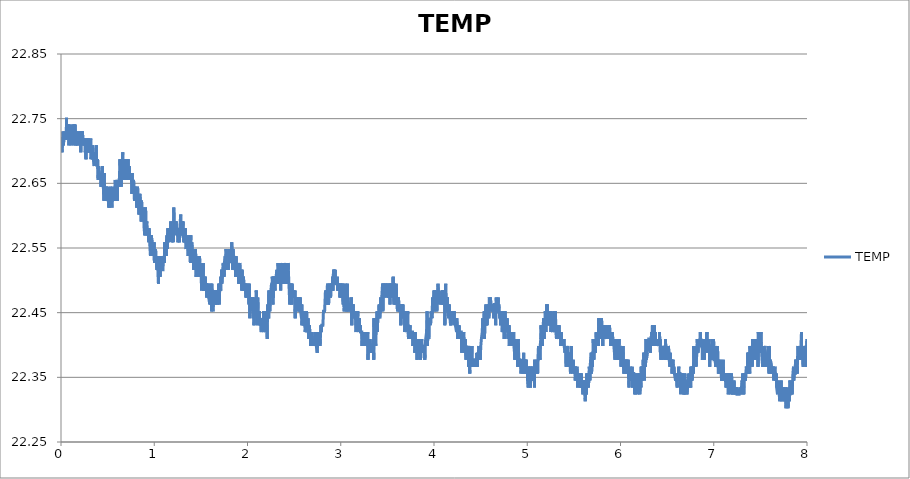
| Category | TEMP |
|---|---|
| 0.0009014404444444445 | 22.719 |
| 0.003960782083333334 | 22.709 |
| 0.007023179472222222 | 22.719 |
| 0.010082798916666667 | 22.698 |
| 0.013142973944444445 | 22.709 |
| 0.01620231561111111 | 22.719 |
| 0.019261657249999998 | 22.719 |
| 0.0223215545 | 22.73 |
| 0.02538089613888889 | 22.709 |
| 0.028439959999999997 | 22.709 |
| 0.03149930166666667 | 22.719 |
| 0.034559754472222225 | 22.719 |
| 0.037619373916666664 | 22.719 |
| 0.04067871558333333 | 22.73 |
| 0.043738057222222224 | 22.719 |
| 0.04679739888888889 | 22.719 |
| 0.04985701833333333 | 22.719 |
| 0.05291635997222222 | 22.719 |
| 0.05597597941666666 | 22.719 |
| 0.059035598861111115 | 22.752 |
| 0.06209466272222222 | 22.719 |
| 0.06515567113888888 | 22.719 |
| 0.06821584616666666 | 22.741 |
| 0.07127518780555556 | 22.73 |
| 0.07433480725 | 22.741 |
| 0.07739414891666667 | 22.719 |
| 0.08045321277777778 | 22.73 |
| 0.08351311 | 22.73 |
| 0.0865721738611111 | 22.709 |
| 0.08963151552777779 | 22.741 |
| 0.09269085716666665 | 22.719 |
| 0.09575158777777777 | 22.73 |
| 0.09881092944444443 | 22.719 |
| 0.10187082666666668 | 22.719 |
| 0.10492989052777778 | 22.73 |
| 0.10798923219444444 | 22.709 |
| 0.11104829602777777 | 22.73 |
| 0.11410763769444444 | 22.73 |
| 0.11716697933333332 | 22.719 |
| 0.12022604319444445 | 22.73 |
| 0.12328566263888889 | 22.741 |
| 0.12634500430555556 | 22.73 |
| 0.12940406816666666 | 22.73 |
| 0.132463132 | 22.719 |
| 0.13552330705555557 | 22.709 |
| 0.1385829265 | 22.73 |
| 0.1416422681388889 | 22.741 |
| 0.14470188758333333 | 22.719 |
| 0.14776122922222223 | 22.719 |
| 0.1508205708888889 | 22.741 |
| 0.15388019033333333 | 22.709 |
| 0.15693925419444443 | 22.709 |
| 0.15999859583333334 | 22.73 |
| 0.1630579375 | 22.719 |
| 0.16611700133333332 | 22.719 |
| 0.169176343 | 22.709 |
| 0.1722356846388889 | 22.719 |
| 0.17529530408333333 | 22.719 |
| 0.17835520133333335 | 22.709 |
| 0.18141454297222223 | 22.73 |
| 0.18447360683333333 | 22.73 |
| 0.1875368376111111 | 22.719 |
| 0.1905967348333333 | 22.719 |
| 0.19365718766666667 | 22.719 |
| 0.1967176405 | 22.719 |
| 0.1997792045 | 22.719 |
| 0.20284049069444443 | 22.73 |
| 0.2059014991111111 | 22.709 |
| 0.20896084075000002 | 22.719 |
| 0.21202101580555555 | 22.698 |
| 0.21508202419444444 | 22.73 |
| 0.21814247702777778 | 22.709 |
| 0.22120209647222222 | 22.719 |
| 0.22426393827777777 | 22.73 |
| 0.2273235577222222 | 22.719 |
| 0.23038428833333333 | 22.73 |
| 0.2334444633611111 | 22.719 |
| 0.23650630516666665 | 22.709 |
| 0.2395675913611111 | 22.719 |
| 0.24262915536111113 | 22.719 |
| 0.24568877480555557 | 22.719 |
| 0.24874811647222222 | 22.719 |
| 0.2518074581111111 | 22.709 |
| 0.25486791094444444 | 22.709 |
| 0.2579280859722222 | 22.719 |
| 0.2609913167222222 | 22.698 |
| 0.2640520473611111 | 22.709 |
| 0.26711722266666665 | 22.687 |
| 0.2701776755 | 22.709 |
| 0.2732603518055556 | 22.709 |
| 0.2763194156666667 | 22.698 |
| 0.2793798685 | 22.719 |
| 0.2824392101388889 | 22.709 |
| 0.28549882958333334 | 22.709 |
| 0.28855817125 | 22.709 |
| 0.29161751288888893 | 22.719 |
| 0.29467685455555553 | 22.698 |
| 0.29773619619444447 | 22.709 |
| 0.30079553786111113 | 22.709 |
| 0.30385515730555557 | 22.698 |
| 0.30691449894444445 | 22.709 |
| 0.3099752295555555 | 22.698 |
| 0.313034849 | 22.709 |
| 0.31609419066666666 | 22.709 |
| 0.31915325452777776 | 22.719 |
| 0.32221315175 | 22.687 |
| 0.32527582694444446 | 22.687 |
| 0.3283354463888889 | 22.687 |
| 0.3313945102222222 | 22.687 |
| 0.3344538518888889 | 22.698 |
| 0.33751486030555555 | 22.709 |
| 0.34057447975000005 | 22.687 |
| 0.34363382138888887 | 22.698 |
| 0.3466942742222222 | 22.687 |
| 0.3497558382222222 | 22.687 |
| 0.3528149020833333 | 22.687 |
| 0.3558742437222222 | 22.677 |
| 0.3589335853888889 | 22.677 |
| 0.3619934826111111 | 22.698 |
| 0.3650531020555556 | 22.687 |
| 0.3681121659166666 | 22.687 |
| 0.3711720631666667 | 22.698 |
| 0.37423612730555555 | 22.687 |
| 0.37729519116666665 | 22.709 |
| 0.38035508838888893 | 22.687 |
| 0.3834147078333333 | 22.677 |
| 0.38647488286111115 | 22.687 |
| 0.38953478011111115 | 22.677 |
| 0.39259439955555553 | 22.687 |
| 0.39565374119444446 | 22.687 |
| 0.3987130828611111 | 22.655 |
| 0.4017721467222222 | 22.666 |
| 0.4048314883611111 | 22.677 |
| 0.40789110780555554 | 22.677 |
| 0.4109504494722222 | 22.666 |
| 0.4140103466944445 | 22.666 |
| 0.4170694105555555 | 22.655 |
| 0.42012875222222223 | 22.655 |
| 0.4231883716666667 | 22.666 |
| 0.42624771330555555 | 22.655 |
| 0.4293081661388889 | 22.645 |
| 0.43236778558333333 | 22.666 |
| 0.43542740502777777 | 22.666 |
| 0.43848730225 | 22.655 |
| 0.4415466439166667 | 22.645 |
| 0.4446059855555556 | 22.677 |
| 0.44766532722222224 | 22.645 |
| 0.4507246688611111 | 22.666 |
| 0.4537840105 | 22.645 |
| 0.4568433521666667 | 22.645 |
| 0.45990324941666666 | 22.623 |
| 0.46296231325000003 | 22.666 |
| 0.46602304388888893 | 22.645 |
| 0.46908544124999996 | 22.623 |
| 0.47214506069444445 | 22.645 |
| 0.4752069025 | 22.645 |
| 0.47826652194444447 | 22.645 |
| 0.48132641919444447 | 22.623 |
| 0.48438576083333335 | 22.645 |
| 0.4874503805555555 | 22.645 |
| 0.4905097222222222 | 22.645 |
| 0.49357323077777776 | 22.645 |
| 0.49663423919444444 | 22.634 |
| 0.4996944142222222 | 22.645 |
| 0.5027543114444445 | 22.634 |
| 0.5058358766111111 | 22.634 |
| 0.50889994075 | 22.634 |
| 0.5119620603333334 | 22.612 |
| 0.5150222353611111 | 22.623 |
| 0.518081577 | 22.634 |
| 0.5211445299722222 | 22.612 |
| 0.5242149833888889 | 22.634 |
| 0.5272784919444444 | 22.623 |
| 0.5303408893055556 | 22.645 |
| 0.53340050875 | 22.623 |
| 0.5364606838055556 | 22.634 |
| 0.5395200254444444 | 22.623 |
| 0.5425793670833333 | 22.623 |
| 0.5456384309444444 | 22.612 |
| 0.5486983281944444 | 22.623 |
| 0.5517590588055555 | 22.645 |
| 0.5548203450277778 | 22.634 |
| 0.5578799644722222 | 22.634 |
| 0.5609398616944444 | 22.623 |
| 0.56400337025 | 22.623 |
| 0.5670652120555556 | 22.623 |
| 0.5701248315 | 22.634 |
| 0.5731861176944445 | 22.634 |
| 0.5762535153611111 | 22.623 |
| 0.579318412888889 | 22.645 |
| 0.5823780323333334 | 22.655 |
| 0.5854382073611112 | 22.634 |
| 0.5884981046111111 | 22.655 |
| 0.5915630021388889 | 22.645 |
| 0.5946242883333334 | 22.645 |
| 0.5976839077777778 | 22.645 |
| 0.6007438050277777 | 22.655 |
| 0.6038053690277777 | 22.623 |
| 0.6068669330277777 | 22.645 |
| 0.6099287748055556 | 22.645 |
| 0.6129889498611111 | 22.655 |
| 0.6160510694444444 | 22.655 |
| 0.6191159669722222 | 22.655 |
| 0.6221755864166667 | 22.645 |
| 0.62523465025 | 22.655 |
| 0.6282978810277777 | 22.666 |
| 0.6313580560555556 | 22.687 |
| 0.6344176755 | 22.677 |
| 0.6374772949444445 | 22.666 |
| 0.6405388589444444 | 22.677 |
| 0.6435987561944445 | 22.666 |
| 0.6466630981111111 | 22.645 |
| 0.6497257733055556 | 22.687 |
| 0.652786226111111 | 22.666 |
| 0.6558483457222222 | 22.677 |
| 0.6589090763333334 | 22.677 |
| 0.6619686957777777 | 22.698 |
| 0.6650305375555556 | 22.677 |
| 0.6680926571666667 | 22.677 |
| 0.671153943361111 | 22.666 |
| 0.6742143961944443 | 22.677 |
| 0.6772748490277777 | 22.655 |
| 0.6803408577222222 | 22.677 |
| 0.6834035328888889 | 22.687 |
| 0.6864650968888889 | 22.655 |
| 0.6895272164722223 | 22.666 |
| 0.6925868359166667 | 22.666 |
| 0.69564728875 | 22.677 |
| 0.698708019361111 | 22.677 |
| 0.7017695833611111 | 22.666 |
| 0.7048294806111112 | 22.666 |
| 0.70788882225 | 22.687 |
| 0.7109506640555556 | 22.687 |
| 0.7140100056944444 | 22.655 |
| 0.7170693473611112 | 22.666 |
| 0.7201292445833334 | 22.687 |
| 0.7231891418333333 | 22.666 |
| 0.7262487612777777 | 22.655 |
| 0.7293081029166667 | 22.666 |
| 0.7323674445833334 | 22.677 |
| 0.735427619611111 | 22.666 |
| 0.7384872390555556 | 22.666 |
| 0.7415490808333334 | 22.666 |
| 0.7446092558888889 | 22.655 |
| 0.7476683197222223 | 22.655 |
| 0.7507276613888889 | 22.655 |
| 0.7537872808333334 | 22.666 |
| 0.7568477336666667 | 22.655 |
| 0.7599104088333334 | 22.634 |
| 0.7629725284166666 | 22.666 |
| 0.7660352035833333 | 22.645 |
| 0.7690948230277778 | 22.655 |
| 0.7721549980833333 | 22.655 |
| 0.77521767325 | 22.645 |
| 0.778278403861111 | 22.655 |
| 0.7813383011111111 | 22.645 |
| 0.7843979205555556 | 22.645 |
| 0.7874619846944444 | 22.623 |
| 0.7905229931111112 | 22.645 |
| 0.79358233475 | 22.645 |
| 0.796642232 | 22.634 |
| 0.7997015736388889 | 22.634 |
| 0.80276230425 | 22.645 |
| 0.8058224793055556 | 22.645 |
| 0.8088851544722223 | 22.623 |
| 0.8119500519999999 | 22.612 |
| 0.8150093936388888 | 22.623 |
| 0.8180726244166667 | 22.612 |
| 0.8211352995833334 | 22.645 |
| 0.8241960301944444 | 22.645 |
| 0.8272562052222222 | 22.623 |
| 0.8303169358611111 | 22.612 |
| 0.8333787776388889 | 22.623 |
| 0.8364389526666667 | 22.602 |
| 0.8395002388888889 | 22.623 |
| 0.8425623584722222 | 22.623 |
| 0.845629478361111 | 22.634 |
| 0.8486899311666667 | 22.634 |
| 0.8517506618055556 | 22.623 |
| 0.8548116701944445 | 22.602 |
| 0.8578721230277777 | 22.623 |
| 0.8609361871666668 | 22.591 |
| 0.8639971955833333 | 22.623 |
| 0.8670573706111111 | 22.612 |
| 0.8701172678611111 | 22.612 |
| 0.8731793874444445 | 22.612 |
| 0.8762426182222223 | 22.602 |
| 0.8793025154444445 | 22.612 |
| 0.8823621348888889 | 22.612 |
| 0.8854234211111112 | 22.602 |
| 0.8884847073055555 | 22.602 |
| 0.8915448823333333 | 22.58 |
| 0.8946086686944444 | 22.58 |
| 0.8976716216666667 | 22.57 |
| 0.9007323522777777 | 22.58 |
| 0.903792805111111 | 22.57 |
| 0.9068554802777777 | 22.612 |
| 0.9099159331111111 | 22.591 |
| 0.9129813862222221 | 22.591 |
| 0.9160410056666667 | 22.58 |
| 0.9191053475833333 | 22.591 |
| 0.9221644114444444 | 22.58 |
| 0.9252254198611112 | 22.57 |
| 0.9282875394444444 | 22.58 |
| 0.9313468811111111 | 22.57 |
| 0.93440622275 | 22.58 |
| 0.9374661200000001 | 22.57 |
| 0.9405329620833334 | 22.559 |
| 0.9435923037222222 | 22.58 |
| 0.9466519231666666 | 22.57 |
| 0.9497129315833334 | 22.57 |
| 0.9527725510277778 | 22.57 |
| 0.9558330038611111 | 22.57 |
| 0.9588931788888889 | 22.538 |
| 0.9619536317222223 | 22.57 |
| 0.9650154734999999 | 22.538 |
| 0.9680750929444445 | 22.57 |
| 0.971134434611111 | 22.57 |
| 0.9741976653611111 | 22.57 |
| 0.9772586737777778 | 22.559 |
| 0.9803205155555555 | 22.559 |
| 0.9833823573611111 | 22.559 |
| 0.9864422546111111 | 22.548 |
| 0.989503818611111 | 22.538 |
| 0.9925651048055555 | 22.548 |
| 0.9956258354166666 | 22.548 |
| 0.9986851770833333 | 22.559 |
| 1.0017445187222223 | 22.527 |
| 1.0048041381666666 | 22.548 |
| 1.0078690356944444 | 22.538 |
| 1.0109311552777778 | 22.538 |
| 1.013991608111111 | 22.548 |
| 1.0170551166666666 | 22.548 |
| 1.0201155695 | 22.527 |
| 1.0231749111388888 | 22.538 |
| 1.0262353639722221 | 22.538 |
| 1.0292988725277779 | 22.516 |
| 1.0323601587222222 | 22.538 |
| 1.0354211671388889 | 22.527 |
| 1.038480231 | 22.527 |
| 1.0415395726666667 | 22.527 |
| 1.0446022478333334 | 22.495 |
| 1.0476668675555556 | 22.527 |
| 1.0507292649444444 | 22.538 |
| 1.0537894399722223 | 22.527 |
| 1.0568543375000001 | 22.506 |
| 1.0599150681111111 | 22.538 |
| 1.062986354888889 | 22.506 |
| 1.066047918888889 | 22.527 |
| 1.0691089273055554 | 22.527 |
| 1.07216854675 | 22.538 |
| 1.07523011075 | 22.516 |
| 1.0782894524166666 | 22.538 |
| 1.0813526831666667 | 22.516 |
| 1.0844161917222221 | 22.516 |
| 1.08747636675 | 22.516 |
| 1.090536264 | 22.516 |
| 1.093597828 | 22.516 |
| 1.0966588364166667 | 22.527 |
| 1.0997215115833332 | 22.527 |
| 1.1027819644166665 | 22.527 |
| 1.1058454729722222 | 22.538 |
| 1.1089062035833332 | 22.527 |
| 1.111968045388889 | 22.559 |
| 1.1150346096666668 | 22.538 |
| 1.1180945068888888 | 22.538 |
| 1.12115357075 | 22.559 |
| 1.1242181905 | 22.559 |
| 1.127277532138889 | 22.538 |
| 1.1303385405555555 | 22.559 |
| 1.1334020491111112 | 22.559 |
| 1.13646139075 | 22.57 |
| 1.1395285106388888 | 22.548 |
| 1.1425897968333334 | 22.57 |
| 1.1456519164166667 | 22.58 |
| 1.148711535861111 | 22.58 |
| 1.1517733776666668 | 22.559 |
| 1.1548354972500001 | 22.559 |
| 1.1578948389166668 | 22.559 |
| 1.160954458361111 | 22.58 |
| 1.1640140778055554 | 22.57 |
| 1.1670767529722221 | 22.57 |
| 1.1701363724166665 | 22.58 |
| 1.1731987698055557 | 22.57 |
| 1.1762589448333334 | 22.591 |
| 1.1793213422222222 | 22.58 |
| 1.1823812394444444 | 22.58 |
| 1.1854436368333334 | 22.559 |
| 1.1885040896666668 | 22.559 |
| 1.1915650980555557 | 22.57 |
| 1.1946291622222223 | 22.58 |
| 1.197691004 | 22.58 |
| 1.2007536791666666 | 22.58 |
| 1.2038191322777778 | 22.559 |
| 1.2068795851111112 | 22.58 |
| 1.2099419825 | 22.612 |
| 1.2130027131111112 | 22.57 |
| 1.2160642771111112 | 22.58 |
| 1.2191252855277779 | 22.58 |
| 1.2221901830555557 | 22.58 |
| 1.2252498025 | 22.591 |
| 1.2283138666388889 | 22.591 |
| 1.2313765418055556 | 22.58 |
| 1.2344406059722224 | 22.591 |
| 1.2375168930277778 | 22.591 |
| 1.240577623638889 | 22.58 |
| 1.2436372430833333 | 22.58 |
| 1.2466979737222221 | 22.57 |
| 1.2497628712222222 | 22.58 |
| 1.2528236018611112 | 22.58 |
| 1.2559004445 | 22.559 |
| 1.2589622863055554 | 22.58 |
| 1.2620213501666666 | 22.57 |
| 1.265085969888889 | 22.58 |
| 1.2681458671388888 | 22.58 |
| 1.271207431138889 | 22.559 |
| 1.2742951077222222 | 22.58 |
| 1.2773569495277777 | 22.58 |
| 1.28041684675 | 22.58 |
| 1.283477577388889 | 22.602 |
| 1.2865380301944445 | 22.57 |
| 1.2895995942222223 | 22.57 |
| 1.292662824972222 | 22.57 |
| 1.2957221666111112 | 22.58 |
| 1.2987826194444445 | 22.58 |
| 1.3018480725555555 | 22.591 |
| 1.304907692 | 22.57 |
| 1.3079703671666667 | 22.591 |
| 1.3110294310277777 | 22.57 |
| 1.3140896060555556 | 22.57 |
| 1.3171525590277777 | 22.559 |
| 1.3202119006944446 | 22.58 |
| 1.3232717979166666 | 22.559 |
| 1.32633225075 | 22.58 |
| 1.3293927035833333 | 22.57 |
| 1.3324534341944445 | 22.58 |
| 1.3355133314444445 | 22.57 |
| 1.3385751732222222 | 22.559 |
| 1.3416347926666667 | 22.548 |
| 1.3446955233055558 | 22.559 |
| 1.3477779218055554 | 22.57 |
| 1.3508389302222223 | 22.559 |
| 1.3539027165833333 | 22.559 |
| 1.356967891888889 | 22.559 |
| 1.3600344561944444 | 22.548 |
| 1.3630943534166666 | 22.538 |
| 1.3661567508055554 | 22.548 |
| 1.3692172036388888 | 22.559 |
| 1.372277100861111 | 22.559 |
| 1.3753433873611112 | 22.57 |
| 1.3784038401944445 | 22.548 |
| 1.38146734875 | 22.538 |
| 1.3845283571666667 | 22.559 |
| 1.3875882543888889 | 22.527 |
| 1.3906481516388887 | 22.57 |
| 1.3937077710833334 | 22.548 |
| 1.3967710018333332 | 22.559 |
| 1.3998325658333333 | 22.538 |
| 1.4028927408611112 | 22.559 |
| 1.405954304861111 | 22.538 |
| 1.4090161466666666 | 22.527 |
| 1.4120765995 | 22.548 |
| 1.4151448305277778 | 22.548 |
| 1.4182041721944445 | 22.538 |
| 1.42127240325 | 22.516 |
| 1.4243361895833333 | 22.538 |
| 1.4273988647777778 | 22.548 |
| 1.4304607065555555 | 22.527 |
| 1.4335419939166667 | 22.516 |
| 1.436603280111111 | 22.527 |
| 1.4396681776388889 | 22.527 |
| 1.442727519277778 | 22.548 |
| 1.4457876943333334 | 22.527 |
| 1.4488484249444447 | 22.506 |
| 1.4519102667500001 | 22.527 |
| 1.4549712751388888 | 22.516 |
| 1.4580356170833335 | 22.506 |
| 1.4610980144722223 | 22.506 |
| 1.4641587450833335 | 22.527 |
| 1.4672205868888888 | 22.538 |
| 1.4702821508888888 | 22.516 |
| 1.4733417703333334 | 22.506 |
| 1.4764033343333334 | 22.516 |
| 1.479462953777778 | 22.527 |
| 1.4825234065833333 | 22.527 |
| 1.485584970611111 | 22.538 |
| 1.4886551461944444 | 22.527 |
| 1.491714765638889 | 22.516 |
| 1.494774662888889 | 22.516 |
| 1.4978348379166666 | 22.516 |
| 1.5008950129444445 | 22.527 |
| 1.5039549101944443 | 22.506 |
| 1.5070253635833335 | 22.484 |
| 1.5101135957777778 | 22.495 |
| 1.5131734930277778 | 22.495 |
| 1.5162328346666667 | 22.506 |
| 1.5192921763055556 | 22.506 |
| 1.5223548515 | 22.495 |
| 1.5254158599166665 | 22.527 |
| 1.5284779795 | 22.484 |
| 1.5315375989444444 | 22.495 |
| 1.5345972183888887 | 22.484 |
| 1.5376612825277778 | 22.495 |
| 1.5407220131388888 | 22.506 |
| 1.5437852439166666 | 22.495 |
| 1.5468451411388888 | 22.506 |
| 1.549905038388889 | 22.484 |
| 1.5529652134166667 | 22.495 |
| 1.5560270552222222 | 22.484 |
| 1.5590861190555556 | 22.495 |
| 1.5621460163055556 | 22.473 |
| 1.5652061913333333 | 22.495 |
| 1.5682691443055556 | 22.495 |
| 1.571330986111111 | 22.495 |
| 1.5743953280277778 | 22.484 |
| 1.5774546696944445 | 22.484 |
| 1.5805176226666668 | 22.495 |
| 1.5835786310833333 | 22.473 |
| 1.58664130625 | 22.473 |
| 1.5897014812777777 | 22.473 |
| 1.592761934111111 | 22.473 |
| 1.5958271094166667 | 22.463 |
| 1.5988897845833334 | 22.463 |
| 1.6019502374166668 | 22.473 |
| 1.6050126348055556 | 22.495 |
| 1.6080775323333334 | 22.463 |
| 1.6111452077777777 | 22.473 |
| 1.6142062161944444 | 22.452 |
| 1.6172655578611113 | 22.495 |
| 1.6203268440555556 | 22.463 |
| 1.6233867413055554 | 22.484 |
| 1.6264460829444445 | 22.463 |
| 1.6295065357777778 | 22.452 |
| 1.6325661552222221 | 22.463 |
| 1.6356304971666666 | 22.473 |
| 1.6386928945277777 | 22.484 |
| 1.6417594588333335 | 22.484 |
| 1.6448243563333333 | 22.484 |
| 1.6478839758055557 | 22.473 |
| 1.6509441508333333 | 22.463 |
| 1.6540037702777777 | 22.484 |
| 1.657065889861111 | 22.473 |
| 1.660135509861111 | 22.463 |
| 1.6631951293055556 | 22.473 |
| 1.6662608602222222 | 22.473 |
| 1.6693207574722222 | 22.484 |
| 1.6723814880833334 | 22.484 |
| 1.6754458300277777 | 22.463 |
| 1.67851044975 | 22.484 |
| 1.6815697913888887 | 22.484 |
| 1.6846302442222223 | 22.484 |
| 1.687689585888889 | 22.473 |
| 1.6907672619166667 | 22.495 |
| 1.6938313260555555 | 22.484 |
| 1.6968909455 | 22.463 |
| 1.699950009361111 | 22.473 |
| 1.7030107399722223 | 22.495 |
| 1.706070637222222 | 22.484 |
| 1.7091327568055554 | 22.495 |
| 1.7121926540277779 | 22.484 |
| 1.7152592183333333 | 22.506 |
| 1.7183199489444445 | 22.495 |
| 1.7213815129444445 | 22.516 |
| 1.7244430769444443 | 22.495 |
| 1.7275024185833334 | 22.495 |
| 1.7305617602499999 | 22.495 |
| 1.7336213796944444 | 22.516 |
| 1.7366859994166668 | 22.516 |
| 1.7397456188611111 | 22.527 |
| 1.7428063494722221 | 22.527 |
| 1.7458659689166667 | 22.527 |
| 1.7489272551388888 | 22.506 |
| 1.75198798575 | 22.527 |
| 1.755047883 | 22.527 |
| 1.7581091691944446 | 22.527 |
| 1.761168510861111 | 22.538 |
| 1.7642289636666666 | 22.516 |
| 1.7672888609166666 | 22.538 |
| 1.7703543140277778 | 22.548 |
| 1.7734136556666666 | 22.527 |
| 1.7764741085 | 22.527 |
| 1.7795367836666667 | 22.516 |
| 1.7825966809166667 | 22.527 |
| 1.7856621340277776 | 22.516 |
| 1.788732309638889 | 22.516 |
| 1.7917941514166666 | 22.527 |
| 1.7948587711666666 | 22.516 |
| 1.797921724138889 | 22.527 |
| 1.8009835659166666 | 22.548 |
| 1.804043185361111 | 22.527 |
| 1.8071036381944443 | 22.538 |
| 1.810167980138889 | 22.548 |
| 1.8132281551666667 | 22.538 |
| 1.8162922193055555 | 22.527 |
| 1.8193518387499998 | 22.538 |
| 1.8224142361388889 | 22.538 |
| 1.8254744111666665 | 22.527 |
| 1.8285354195833332 | 22.548 |
| 1.831596428 | 22.559 |
| 1.8346591031666668 | 22.538 |
| 1.8377203893611112 | 22.538 |
| 1.8407825089444443 | 22.516 |
| 1.843842128388889 | 22.548 |
| 1.8469100816666666 | 22.548 |
| 1.8499697011111111 | 22.538 |
| 1.8530320984722224 | 22.538 |
| 1.8560922735277778 | 22.527 |
| 1.85915217075 | 22.538 |
| 1.8622123457777777 | 22.538 |
| 1.8652747431666665 | 22.538 |
| 1.868336029361111 | 22.527 |
| 1.8714037048333332 | 22.506 |
| 1.87446471325 | 22.516 |
| 1.8775243326944444 | 22.538 |
| 1.8805842299166668 | 22.527 |
| 1.8836444049722223 | 22.527 |
| 1.886703746611111 | 22.527 |
| 1.8897650328055555 | 22.516 |
| 1.8928393753333332 | 22.506 |
| 1.8959012171111111 | 22.527 |
| 1.8989611143611111 | 22.516 |
| 1.9020224005555555 | 22.527 |
| 1.9050831311944443 | 22.495 |
| 1.9081455285555555 | 22.506 |
| 1.9112098704999998 | 22.516 |
| 1.914268934361111 | 22.516 |
| 1.9173382765833333 | 22.527 |
| 1.9203976182222222 | 22.516 |
| 1.9234569598888889 | 22.506 |
| 1.9265168571388889 | 22.495 |
| 1.9295770321666665 | 22.516 |
| 1.93263915175 | 22.516 |
| 1.9357034936944446 | 22.495 |
| 1.9387642243055554 | 22.484 |
| 1.9418246771388887 | 22.516 |
| 1.9448842965833335 | 22.506 |
| 1.9479461383611112 | 22.484 |
| 1.9510071467777779 | 22.506 |
| 1.9540695441666667 | 22.495 |
| 1.9571322193333334 | 22.506 |
| 1.9601932277499998 | 22.506 |
| 1.9632561807222222 | 22.484 |
| 1.9663158001666667 | 22.495 |
| 1.969375419611111 | 22.495 |
| 1.9724361502222223 | 22.484 |
| 1.9755060480277777 | 22.495 |
| 1.9785670564444444 | 22.495 |
| 1.981632787361111 | 22.495 |
| 1.984692129 | 22.473 |
| 1.987778138861111 | 22.495 |
| 1.9908410918055557 | 22.473 |
| 1.99390543375 | 22.484 |
| 1.996967831138889 | 22.484 |
| 2.0000391179166668 | 22.484 |
| 2.003100126333333 | 22.484 |
| 2.0061655794444446 | 22.484 |
| 2.0092260322777777 | 22.495 |
| 2.012285373916667 | 22.473 |
| 2.0153494380555554 | 22.463 |
| 2.0184121132222224 | 22.495 |
| 2.0214772885555554 | 22.473 |
| 2.024551353277778 | 22.441 |
| 2.027610694916667 | 22.463 |
| 2.0306705921666666 | 22.452 |
| 2.0337324339444445 | 22.473 |
| 2.036796498083333 | 22.463 |
| 2.0398583398888888 | 22.463 |
| 2.0429182371388888 | 22.463 |
| 2.0459778565833333 | 22.473 |
| 2.049037476027778 | 22.463 |
| 2.052096539861111 | 22.463 |
| 2.0551581038611113 | 22.473 |
| 2.058221612416667 | 22.452 |
| 2.0612845653888887 | 22.441 |
| 2.0643450182222223 | 22.452 |
| 2.0674046376666664 | 22.473 |
| 2.070464534916667 | 22.431 |
| 2.073526932277778 | 22.452 |
| 2.076586829527778 | 22.463 |
| 2.0796483935277776 | 22.452 |
| 2.082708012972222 | 22.452 |
| 2.0857687435833334 | 22.452 |
| 2.088830585388889 | 22.463 |
| 2.0918952051111113 | 22.452 |
| 2.0949556579444444 | 22.484 |
| 2.098015832972222 | 22.452 |
| 2.101076008 | 22.452 |
| 2.1041364608333333 | 22.431 |
| 2.107197747027778 | 22.441 |
| 2.1102618111666667 | 22.473 |
| 2.1133217084166667 | 22.452 |
| 2.116382439027778 | 22.441 |
| 2.1194476143611114 | 22.441 |
| 2.122510845111111 | 22.441 |
| 2.1255707423611114 | 22.441 |
| 2.128630639583333 | 22.452 |
| 2.1316910924166668 | 22.431 |
| 2.134754323194444 | 22.441 |
| 2.1378161649722225 | 22.431 |
| 2.140891340861111 | 22.441 |
| 2.143952904861111 | 22.431 |
| 2.1470136355 | 22.42 |
| 2.1500738105277777 | 22.441 |
| 2.1531362078888887 | 22.441 |
| 2.1561997164444446 | 22.42 |
| 2.159259058111111 | 22.431 |
| 2.1623211776944444 | 22.431 |
| 2.165380797138889 | 22.431 |
| 2.168440694388889 | 22.42 |
| 2.171500313833333 | 22.452 |
| 2.174566322527778 | 22.42 |
| 2.1776345535555555 | 22.42 |
| 2.180694173027778 | 22.42 |
| 2.1837543480555555 | 22.42 |
| 2.1868145230833336 | 22.441 |
| 2.189876364861111 | 22.431 |
| 2.1929357065277775 | 22.42 |
| 2.195994770388889 | 22.452 |
| 2.1990557788055556 | 22.431 |
| 2.202122065277778 | 22.441 |
| 2.205185851638889 | 22.431 |
| 2.2082549160555556 | 22.431 |
| 2.2113162022777777 | 22.409 |
| 2.2143777662777775 | 22.452 |
| 2.2174398858611113 | 22.463 |
| 2.220501449861111 | 22.441 |
| 2.2235610693055556 | 22.452 |
| 2.2266315226944444 | 22.441 |
| 2.2296936422777778 | 22.484 |
| 2.2327535395277778 | 22.463 |
| 2.2358131589722223 | 22.473 |
| 2.2388722228333333 | 22.452 |
| 2.2419321200555555 | 22.473 |
| 2.245003406861111 | 22.473 |
| 2.2480641374722223 | 22.473 |
| 2.2511262570555557 | 22.484 |
| 2.2541872654722224 | 22.484 |
| 2.2572485516666667 | 22.495 |
| 2.2603081711111113 | 22.473 |
| 2.2633711240833336 | 22.495 |
| 2.2664324103055553 | 22.506 |
| 2.2694920297500003 | 22.484 |
| 2.272554149333333 | 22.463 |
| 2.2756151577500003 | 22.506 |
| 2.2786772773333333 | 22.473 |
| 2.281743841611111 | 22.506 |
| 2.284804294444444 | 22.495 |
| 2.2878683585833333 | 22.495 |
| 2.2909993710000003 | 22.506 |
| 2.2940617683888886 | 22.484 |
| 2.2971222211944444 | 22.506 |
| 2.3001821184444444 | 22.495 |
| 2.3032453491944445 | 22.495 |
| 2.3063083021666664 | 22.506 |
| 2.309372366305556 | 22.506 |
| 2.3124325413611113 | 22.506 |
| 2.3154943831388892 | 22.516 |
| 2.318555113777778 | 22.495 |
| 2.3216177889444443 | 22.495 |
| 2.324679908527778 | 22.506 |
| 2.327741472527778 | 22.527 |
| 2.33080609225 | 22.506 |
| 2.3338696008055555 | 22.527 |
| 2.3369286646666665 | 22.506 |
| 2.3399896730833336 | 22.527 |
| 2.343052070472222 | 22.495 |
| 2.3461122455 | 22.527 |
| 2.349174642888889 | 22.516 |
| 2.3522350956944447 | 22.516 |
| 2.355294437361111 | 22.484 |
| 2.3583540568055557 | 22.506 |
| 2.3614150652222223 | 22.527 |
| 2.364474406861111 | 22.495 |
| 2.367534304111111 | 22.516 |
| 2.3705978126666665 | 22.516 |
| 2.373657432111111 | 22.516 |
| 2.376725385361111 | 22.495 |
| 2.3797897273055555 | 22.527 |
| 2.382854069222222 | 22.495 |
| 2.3859145220555558 | 22.506 |
| 2.3889744193055553 | 22.527 |
| 2.3920526509166664 | 22.516 |
| 2.3951256044444444 | 22.516 |
| 2.398185223888889 | 22.506 |
| 2.4012484546666664 | 22.506 |
| 2.4043114076388887 | 22.506 |
| 2.4073724160555554 | 22.495 |
| 2.410434535638889 | 22.516 |
| 2.4134972108055557 | 22.527 |
| 2.4165571080555557 | 22.495 |
| 2.4196172830833333 | 22.495 |
| 2.42268468075 | 22.506 |
| 2.425744022388889 | 22.506 |
| 2.428805030805556 | 22.495 |
| 2.4318643724722224 | 22.495 |
| 2.4349237141111115 | 22.527 |
| 2.4379858336944444 | 22.516 |
| 2.441080455138889 | 22.506 |
| 2.4441411857777777 | 22.495 |
| 2.4472069166666666 | 22.495 |
| 2.4502670916944442 | 22.495 |
| 2.4533328226111113 | 22.463 |
| 2.456394386611111 | 22.495 |
| 2.4594551172222223 | 22.495 |
| 2.4625164034444444 | 22.495 |
| 2.465579078611111 | 22.495 |
| 2.468639531444444 | 22.484 |
| 2.471699706472222 | 22.495 |
| 2.474760714888889 | 22.463 |
| 2.47781977875 | 22.495 |
| 2.4808824539166667 | 22.484 |
| 2.4839426289444444 | 22.473 |
| 2.4870030817777775 | 22.484 |
| 2.4900638123888887 | 22.473 |
| 2.493125376388889 | 22.484 |
| 2.496185829222222 | 22.484 |
| 2.499245170861111 | 22.484 |
| 2.502305068111111 | 22.484 |
| 2.5053696878333334 | 22.473 |
| 2.508434029777778 | 22.484 |
| 2.5114961493611108 | 22.441 |
| 2.514556324388889 | 22.463 |
| 2.5176176106111114 | 22.473 |
| 2.520678619 | 22.463 |
| 2.523744627722222 | 22.473 |
| 2.526805358333333 | 22.473 |
| 2.5298680335 | 22.463 |
| 2.532930430888889 | 22.463 |
| 2.535990883722222 | 22.463 |
| 2.5390516143333333 | 22.452 |
| 2.542113456138889 | 22.473 |
| 2.5451741867499997 | 22.463 |
| 2.548234917361111 | 22.463 |
| 2.5512987037222223 | 22.452 |
| 2.5543594343333336 | 22.473 |
| 2.557419331583333 | 22.463 |
| 2.5604795066111112 | 22.452 |
| 2.5635388482500003 | 22.452 |
| 2.5665987455 | 22.473 |
| 2.569661420666667 | 22.452 |
| 2.5727254848055554 | 22.452 |
| 2.5757853820555554 | 22.452 |
| 2.578853890888889 | 22.441 |
| 2.5819146215 | 22.463 |
| 2.5849761855000004 | 22.431 |
| 2.5880358049444445 | 22.452 |
| 2.59109598 | 22.452 |
| 2.5941561550277776 | 22.441 |
| 2.5972185523888887 | 22.452 |
| 2.600279838611111 | 22.431 |
| 2.6033402914444443 | 22.441 |
| 2.6064029666111113 | 22.441 |
| 2.6094628638333335 | 22.441 |
| 2.6125394286944443 | 22.431 |
| 2.61560765975 | 22.452 |
| 2.618672557277778 | 22.42 |
| 2.621734399083333 | 22.42 |
| 2.624794851888889 | 22.431 |
| 2.6278553047222224 | 22.431 |
| 2.6309143685833334 | 22.42 |
| 2.633975099194444 | 22.452 |
| 2.637034718638889 | 22.42 |
| 2.6400968382222225 | 22.431 |
| 2.6431631247222223 | 22.42 |
| 2.646222466388889 | 22.42 |
| 2.6492831970000004 | 22.441 |
| 2.6523430942222226 | 22.42 |
| 2.6554052138333333 | 22.409 |
| 2.6584648332777774 | 22.42 |
| 2.6615288974166664 | 22.42 |
| 2.664593794944444 | 22.431 |
| 2.6676536921666667 | 22.42 |
| 2.6707141450000003 | 22.409 |
| 2.673788765305556 | 22.42 |
| 2.676850884888889 | 22.399 |
| 2.6799163380000004 | 22.42 |
| 2.6829815133055557 | 22.409 |
| 2.6860422439444442 | 22.409 |
| 2.689103530138889 | 22.399 |
| 2.6921642607500003 | 22.42 |
| 2.695235825333333 | 22.399 |
| 2.698299333888889 | 22.409 |
| 2.7013633980277776 | 22.399 |
| 2.704428017777778 | 22.409 |
| 2.707487637222222 | 22.409 |
| 2.71054781225 | 22.399 |
| 2.71360937625 | 22.409 |
| 2.7166689956944445 | 22.399 |
| 2.719728615138889 | 22.399 |
| 2.7227890679444444 | 22.409 |
| 2.7258553544444446 | 22.409 |
| 2.728914696111111 | 22.42 |
| 2.7319745933333333 | 22.399 |
| 2.7350339349999997 | 22.409 |
| 2.7380938322222224 | 22.399 |
| 2.741154285055556 | 22.399 |
| 2.7442172380277774 | 22.399 |
| 2.7472790798055557 | 22.388 |
| 2.7503406438055555 | 22.399 |
| 2.753401374444444 | 22.42 |
| 2.7564634940277775 | 22.409 |
| 2.7595245024444446 | 22.409 |
| 2.7625855108611113 | 22.409 |
| 2.765645685888889 | 22.409 |
| 2.7687050275277776 | 22.42 |
| 2.7717663137499997 | 22.42 |
| 2.7748459343333334 | 22.409 |
| 2.7779058315555556 | 22.399 |
| 2.780974062611111 | 22.409 |
| 2.7840378489722224 | 22.42 |
| 2.7870974684166665 | 22.431 |
| 2.7901584768333336 | 22.42 |
| 2.7932214297777778 | 22.42 |
| 2.796280493638889 | 22.431 |
| 2.7993409464722223 | 22.431 |
| 2.8024011215 | 22.431 |
| 2.8054632410833333 | 22.431 |
| 2.808522860527778 | 22.431 |
| 2.81158886925 | 22.431 |
| 2.8146509888333333 | 22.452 |
| 2.817710608277778 | 22.452 |
| 2.820769672138889 | 22.452 |
| 2.8238304027499996 | 22.452 |
| 2.826890022194444 | 22.452 |
| 2.8299504750277777 | 22.463 |
| 2.8330095388611114 | 22.463 |
| 2.8360708250833335 | 22.484 |
| 2.839135722611111 | 22.473 |
| 2.842198953361111 | 22.463 |
| 2.8452602395833333 | 22.463 |
| 2.848325414888889 | 22.484 |
| 2.851385867722222 | 22.473 |
| 2.8544465983333334 | 22.484 |
| 2.8575064955833334 | 22.495 |
| 2.8605669483888887 | 22.463 |
| 2.8636287901944444 | 22.473 |
| 2.8666900763888887 | 22.495 |
| 2.8697502514444446 | 22.463 |
| 2.872819038083333 | 22.484 |
| 2.8758819910277778 | 22.484 |
| 2.8789416104722223 | 22.484 |
| 2.8820015077222223 | 22.484 |
| 2.885063905111111 | 22.495 |
| 2.8881243579166664 | 22.495 |
| 2.891183699583333 | 22.473 |
| 2.894243319027778 | 22.495 |
| 2.89730321625 | 22.484 |
| 2.900367002611111 | 22.484 |
| 2.903427455444444 | 22.495 |
| 2.906492352972222 | 22.495 |
| 2.9095572505 | 22.484 |
| 2.9126185366944446 | 22.506 |
| 2.915684545388889 | 22.484 |
| 2.9187447204166665 | 22.495 |
| 2.9218060066388887 | 22.516 |
| 2.924878404583333 | 22.495 |
| 2.9279380240277777 | 22.495 |
| 2.93100264375 | 22.516 |
| 2.934066430111111 | 22.495 |
| 2.937129105277778 | 22.495 |
| 2.9401884469444446 | 22.516 |
| 2.9432600115 | 22.495 |
| 2.946319353166667 | 22.506 |
| 2.949380361583333 | 22.495 |
| 2.9524397032222223 | 22.495 |
| 2.9555026561944446 | 22.495 |
| 2.958562553416667 | 22.495 |
| 2.9616235618333335 | 22.495 |
| 2.9646854036388888 | 22.506 |
| 2.967746689833333 | 22.484 |
| 2.9708079760555552 | 22.495 |
| 2.97388676325 | 22.484 |
| 2.976946104916667 | 22.495 |
| 2.9800079466944442 | 22.495 |
| 2.983067288361111 | 22.495 |
| 2.9861285745555555 | 22.484 |
| 2.9891901385555557 | 22.495 |
| 2.992253647111111 | 22.473 |
| 2.9953252116944444 | 22.495 |
| 2.9983867756944442 | 22.495 |
| 3.0014461173333333 | 22.495 |
| 3.0045057367777774 | 22.473 |
| 3.00756868975 | 22.484 |
| 3.01063025375 | 22.495 |
| 3.0136940401111114 | 22.484 |
| 3.0167550485277776 | 22.484 |
| 3.0198152235555558 | 22.484 |
| 3.022879843277778 | 22.495 |
| 3.0259400183055556 | 22.463 |
| 3.029002971277778 | 22.484 |
| 3.03206592425 | 22.484 |
| 3.0351272104444442 | 22.484 |
| 3.0381887744444445 | 22.452 |
| 3.041249505083333 | 22.473 |
| 3.044309957888889 | 22.495 |
| 3.0473773555555557 | 22.484 |
| 3.050436697222222 | 22.473 |
| 3.053500205777778 | 22.484 |
| 3.0565601030000003 | 22.452 |
| 3.05962000025 | 22.463 |
| 3.062684619972222 | 22.473 |
| 3.065747295166666 | 22.452 |
| 3.0688255267777778 | 22.495 |
| 3.071885146222222 | 22.473 |
| 3.0749455990555554 | 22.452 |
| 3.078007718638889 | 22.473 |
| 3.0810701160277776 | 22.452 |
| 3.084139736027778 | 22.452 |
| 3.087205744722222 | 22.463 |
| 3.0902656419722225 | 22.463 |
| 3.0933274837777778 | 22.463 |
| 3.096386825416667 | 22.463 |
| 3.0994458892777774 | 22.463 |
| 3.1025082866666667 | 22.452 |
| 3.105568739472222 | 22.452 |
| 3.108628358916667 | 22.463 |
| 3.1116882561666666 | 22.452 |
| 3.1147492645833337 | 22.473 |
| 3.117811106361111 | 22.431 |
| 3.1208704480277776 | 22.463 |
| 3.1239317342222224 | 22.463 |
| 3.126991631472222 | 22.452 |
| 3.130051528694444 | 22.452 |
| 3.1331122593333336 | 22.463 |
| 3.1361721565555554 | 22.452 |
| 3.1392342761388887 | 22.452 |
| 3.1422969513333334 | 22.452 |
| 3.1453626822222223 | 22.441 |
| 3.148424524027778 | 22.452 |
| 3.151497755361111 | 22.441 |
| 3.1545629306666667 | 22.441 |
| 3.1576308839444445 | 22.452 |
| 3.160690225583333 | 22.431 |
| 3.1637740130833336 | 22.42 |
| 3.1668372438333336 | 22.431 |
| 3.169897141083333 | 22.441 |
| 3.1729578716944444 | 22.441 |
| 3.1760172133333335 | 22.441 |
| 3.1790768327777776 | 22.431 |
| 3.1821386745833333 | 22.452 |
| 3.1852057944722225 | 22.42 |
| 3.188267080666667 | 22.42 |
| 3.1913344783333333 | 22.441 |
| 3.1943960423333335 | 22.441 |
| 3.197455383972222 | 22.431 |
| 3.200515559027778 | 22.441 |
| 3.203575178472222 | 22.42 |
| 3.2066342423055554 | 22.42 |
| 3.2096971952777777 | 22.431 |
| 3.212758759277778 | 22.42 |
| 3.215818378722222 | 22.42 |
| 3.2188788315555557 | 22.42 |
| 3.2219428956944447 | 22.42 |
| 3.225003348527778 | 22.42 |
| 3.2280660236944443 | 22.399 |
| 3.2311250875555557 | 22.42 |
| 3.234185540388889 | 22.399 |
| 3.237255716 | 22.409 |
| 3.2403172799999997 | 22.409 |
| 3.243377455027778 | 22.399 |
| 3.246440685777778 | 22.42 |
| 3.2495016941944446 | 22.409 |
| 3.2525646471666665 | 22.409 |
| 3.255624266611111 | 22.399 |
| 3.2586958311944443 | 22.409 |
| 3.261757672972222 | 22.409 |
| 3.2648167368333336 | 22.42 |
| 3.2678760784722223 | 22.399 |
| 3.270937642472222 | 22.409 |
| 3.2739972619166666 | 22.409 |
| 3.277059937111111 | 22.409 |
| 3.2801212233055552 | 22.399 |
| 3.2831819539166665 | 22.399 |
| 3.286241573388889 | 22.399 |
| 3.289308971055555 | 22.42 |
| 3.2923691460833333 | 22.377 |
| 3.295429321111111 | 22.399 |
| 3.298491162888889 | 22.399 |
| 3.3015543936666663 | 22.399 |
| 3.3046137353055554 | 22.399 |
| 3.307673076972222 | 22.399 |
| 3.310733807583333 | 22.399 |
| 3.313798705111111 | 22.409 |
| 3.3168586023333333 | 22.409 |
| 3.3199179439999997 | 22.399 |
| 3.322977007861111 | 22.388 |
| 3.3260394052500004 | 22.399 |
| 3.3291098586388888 | 22.388 |
| 3.332169200277778 | 22.399 |
| 3.335231875472222 | 22.399 |
| 3.338297050777778 | 22.399 |
| 3.3413594481666666 | 22.388 |
| 3.3444243456944442 | 22.388 |
| 3.3474920211388888 | 22.399 |
| 3.3505519183888888 | 22.409 |
| 3.353612093416667 | 22.377 |
| 3.3566719906666664 | 22.441 |
| 3.3597363325833336 | 22.409 |
| 3.362799007777778 | 22.42 |
| 3.3658600161666667 | 22.42 |
| 3.3689243581111112 | 22.399 |
| 3.371989255638889 | 22.409 |
| 3.375049152888889 | 22.399 |
| 3.3781087723333334 | 22.431 |
| 3.3811681139722225 | 22.441 |
| 3.3842310669444444 | 22.431 |
| 3.3872931865277778 | 22.431 |
| 3.39036725125 | 22.452 |
| 3.393427426277778 | 22.42 |
| 3.396500379805556 | 22.441 |
| 3.3995677774722224 | 22.441 |
| 3.4026307304444448 | 22.452 |
| 3.4056922944444445 | 22.452 |
| 3.4087602477222223 | 22.441 |
| 3.4118193115555555 | 22.463 |
| 3.4148819867499998 | 22.452 |
| 3.4179504955833333 | 22.441 |
| 3.4210109484166664 | 22.441 |
| 3.4240714012222226 | 22.452 |
| 3.427130742888889 | 22.473 |
| 3.4301923068888893 | 22.452 |
| 3.4332530374999997 | 22.452 |
| 3.4363165460555556 | 22.463 |
| 3.439379499027778 | 22.473 |
| 3.4424457855277777 | 22.473 |
| 3.445505404972222 | 22.473 |
| 3.448566413388889 | 22.495 |
| 3.4516268661944443 | 22.452 |
| 3.4546892635833335 | 22.495 |
| 3.4577488830277776 | 22.473 |
| 3.460808502472222 | 22.473 |
| 3.4638789558611114 | 22.495 |
| 3.466939130916667 | 22.484 |
| 3.470000417111111 | 22.473 |
| 3.4730617033333333 | 22.484 |
| 3.4761246562777774 | 22.484 |
| 3.479186498083333 | 22.495 |
| 3.4822466731111112 | 22.495 |
| 3.4853060147777777 | 22.484 |
| 3.4883664675833335 | 22.495 |
| 3.4914277538055556 | 22.495 |
| 3.4944870954444442 | 22.484 |
| 3.497547548277778 | 22.473 |
| 3.5006093900555557 | 22.484 |
| 3.5036690095 | 22.495 |
| 3.5067294623333334 | 22.495 |
| 3.5097996379444445 | 22.495 |
| 3.512859257388889 | 22.473 |
| 3.5159194324166667 | 22.473 |
| 3.5189812742222224 | 22.495 |
| 3.5220420048333336 | 22.495 |
| 3.525105513388889 | 22.484 |
| 3.528168466361111 | 22.463 |
| 3.5312344750555558 | 22.495 |
| 3.534298539194445 | 22.484 |
| 3.537359269805555 | 22.484 |
| 3.5404200004444446 | 22.495 |
| 3.543486009138889 | 22.473 |
| 3.546553962388889 | 22.473 |
| 3.5496135818333334 | 22.473 |
| 3.552677923777778 | 22.495 |
| 3.555741154527778 | 22.495 |
| 3.558801607361111 | 22.484 |
| 3.5618617823888887 | 22.506 |
| 3.564922513 | 22.495 |
| 3.56798241025 | 22.473 |
| 3.571042585277778 | 22.463 |
| 3.574104149277778 | 22.495 |
| 3.577169602388889 | 22.495 |
| 3.580229221833333 | 22.473 |
| 3.5832885635 | 22.463 |
| 3.5863490163055554 | 22.473 |
| 3.5894153028055555 | 22.484 |
| 3.5924782557777775 | 22.484 |
| 3.5955384308055556 | 22.495 |
| 3.598603606138889 | 22.473 |
| 3.6016635033611113 | 22.463 |
| 3.6047275675000003 | 22.473 |
| 3.6077899648888887 | 22.452 |
| 3.6108526400555556 | 22.473 |
| 3.6139142040555554 | 22.473 |
| 3.6169735457222223 | 22.463 |
| 3.620033998555556 | 22.473 |
| 3.62310000725 | 22.452 |
| 3.6261607378611114 | 22.463 |
| 3.6292211906944445 | 22.452 |
| 3.6322810879166667 | 22.452 |
| 3.635340429583333 | 22.452 |
| 3.63840310475 | 22.452 |
| 3.641469669027778 | 22.463 |
| 3.644529566277778 | 22.431 |
| 3.6475897413055556 | 22.431 |
| 3.6506513053055554 | 22.463 |
| 3.653711758138889 | 22.452 |
| 3.656771377583333 | 22.463 |
| 3.6598340527500004 | 22.452 |
| 3.662893394416667 | 22.441 |
| 3.665953013861111 | 22.463 |
| 3.669021244888889 | 22.452 |
| 3.6720825311111107 | 22.441 |
| 3.6751457618611107 | 22.452 |
| 3.678210659388889 | 22.441 |
| 3.6812755569166664 | 22.441 |
| 3.6843368431111108 | 22.452 |
| 3.6873964625555558 | 22.42 |
| 3.6904580265555555 | 22.452 |
| 3.6935220907222224 | 22.431 |
| 3.696581710166667 | 22.431 |
| 3.699641607388889 | 22.431 |
| 3.7027015046388887 | 22.42 |
| 3.7057636242222225 | 22.441 |
| 3.7088232436666666 | 22.431 |
| 3.711882863111111 | 22.42 |
| 3.714943038138889 | 22.42 |
| 3.7180051577222226 | 22.452 |
| 3.721067832916667 | 22.42 |
| 3.7241293969166667 | 22.42 |
| 3.7271951278055555 | 22.409 |
| 3.730255580638889 | 22.42 |
| 3.7333149222777777 | 22.42 |
| 3.7363773196666665 | 22.431 |
| 3.7394399948333334 | 22.42 |
| 3.7424993365 | 22.431 |
| 3.745558678138889 | 22.409 |
| 3.7486227422777776 | 22.42 |
| 3.7516837506944447 | 22.409 |
| 3.7547436479444443 | 22.409 |
| 3.7578146569166666 | 22.42 |
| 3.7608739985833335 | 22.42 |
| 3.763936118166667 | 22.42 |
| 3.7669954598055555 | 22.42 |
| 3.770057579388889 | 22.42 |
| 3.773121087944445 | 22.399 |
| 3.7761809851944443 | 22.409 |
| 3.7792406046388893 | 22.409 |
| 3.7823080023055557 | 22.409 |
| 3.7853706774722222 | 22.42 |
| 3.7884308525277777 | 22.42 |
| 3.7915015836944446 | 22.409 |
| 3.794564258888889 | 22.388 |
| 3.797624156111111 | 22.42 |
| 3.8006923871666665 | 22.409 |
| 3.8037525621944446 | 22.409 |
| 3.80681607075 | 22.399 |
| 3.8098754124166665 | 22.388 |
| 3.8129366986111113 | 22.388 |
| 3.815997151444445 | 22.399 |
| 3.819057882055555 | 22.377 |
| 3.8221175015 | 22.399 |
| 3.825178787722222 | 22.409 |
| 3.828259519472222 | 22.388 |
| 3.8313224724444446 | 22.409 |
| 3.8343818140833337 | 22.399 |
| 3.837442266916667 | 22.399 |
| 3.8405038309166666 | 22.388 |
| 3.8435640059444443 | 22.388 |
| 3.8466247365833333 | 22.388 |
| 3.849684078222222 | 22.399 |
| 3.8527453644166663 | 22.388 |
| 3.8558049838611113 | 22.377 |
| 3.8588643255277777 | 22.388 |
| 3.861925611722222 | 22.388 |
| 3.864986620138889 | 22.399 |
| 3.8680459618055556 | 22.409 |
| 3.871108636972222 | 22.388 |
| 3.874167978611111 | 22.399 |
| 3.8772284314444443 | 22.399 |
| 3.88029027325 | 22.399 |
| 3.883356004138889 | 22.399 |
| 3.8864172903611114 | 22.399 |
| 3.8894802433333333 | 22.399 |
| 3.8925393071666665 | 22.388 |
| 3.895600315583333 | 22.399 |
| 3.8986674354722224 | 22.399 |
| 3.9017273326944446 | 22.377 |
| 3.9047886189166667 | 22.399 |
| 3.907849905111111 | 22.399 |
| 3.9109092467777775 | 22.409 |
| 3.9139685884166666 | 22.409 |
| 3.917036263888889 | 22.409 |
| 3.9200967166944443 | 22.42 |
| 3.923162447611111 | 22.42 |
| 3.92622651175 | 22.452 |
| 3.9292900203055554 | 22.399 |
| 3.9323507509166666 | 22.409 |
| 3.9354120371388888 | 22.42 |
| 3.938479157 | 22.42 |
| 3.9415482214444446 | 22.42 |
| 3.944609229861111 | 22.409 |
| 3.9476685715 | 22.431 |
| 3.9507315244722223 | 22.441 |
| 3.953792532888889 | 22.441 |
| 3.956856319222222 | 22.441 |
| 3.9599301061666665 | 22.441 |
| 3.9629894478055556 | 22.431 |
| 3.966051011805556 | 22.441 |
| 3.969111464638889 | 22.452 |
| 3.9721730286388888 | 22.452 |
| 3.9752326480833333 | 22.452 |
| 3.978292823111111 | 22.441 |
| 3.981352998138889 | 22.452 |
| 3.984413450972222 | 22.473 |
| 3.9874725148333336 | 22.452 |
| 3.990534634416667 | 22.452 |
| 3.993597587388889 | 22.452 |
| 3.996660540361111 | 22.463 |
| 3.9997196041944445 | 22.484 |
| 4.002781168194444 | 22.452 |
| 4.005847454694444 | 22.484 |
| 4.008909852083334 | 22.484 |
| 4.011969193722222 | 22.473 |
| 4.0150288131666665 | 22.473 |
| 4.018090377166667 | 22.452 |
| 4.021158330444444 | 22.452 |
| 4.0242179498888895 | 22.484 |
| 4.027279236083333 | 22.463 |
| 4.0303385777222225 | 22.452 |
| 4.033402364083333 | 22.463 |
| 4.036462261333333 | 22.463 |
| 4.039527158833334 | 22.473 |
| 4.0425948343055556 | 22.495 |
| 4.0456561205 | 22.495 |
| 4.048716851138889 | 22.473 |
| 4.051778137333334 | 22.484 |
| 4.054837479 | 22.473 |
| 4.057896820638889 | 22.473 |
| 4.060960607 | 22.463 |
| 4.064023559972222 | 22.473 |
| 4.067088457472222 | 22.473 |
| 4.070154466194444 | 22.473 |
| 4.073227141916667 | 22.473 |
| 4.076286761388889 | 22.473 |
| 4.079346380833333 | 22.463 |
| 4.082406833638888 | 22.473 |
| 4.085467008666667 | 22.484 |
| 4.088531350611111 | 22.473 |
| 4.091592359027778 | 22.484 |
| 4.094651700666667 | 22.463 |
| 4.097711042333333 | 22.473 |
| 4.100775939861111 | 22.484 |
| 4.103835003722223 | 22.463 |
| 4.106895456527778 | 22.473 |
| 4.109954798194444 | 22.463 |
| 4.113016639972222 | 22.473 |
| 4.116075703833333 | 22.431 |
| 4.119135323277778 | 22.441 |
| 4.1221966095 | 22.484 |
| 4.125257062305556 | 22.495 |
| 4.128316681749999 | 22.473 |
| 4.131376301194445 | 22.473 |
| 4.1344423099166665 | 22.452 |
| 4.1375047072777775 | 22.473 |
| 4.140565437916667 | 22.452 |
| 4.143626446305555 | 22.473 |
| 4.146686621361111 | 22.452 |
| 4.149746240805555 | 22.463 |
| 4.152806971416667 | 22.452 |
| 4.155866313055555 | 22.452 |
| 4.158928432638889 | 22.441 |
| 4.161989996666667 | 22.463 |
| 4.165056005361111 | 22.463 |
| 4.168115902583334 | 22.463 |
| 4.171176355416667 | 22.441 |
| 4.174239863972222 | 22.441 |
| 4.177299205611111 | 22.431 |
| 4.1803588250555554 | 22.452 |
| 4.183417888916667 | 22.431 |
| 4.1864786195555554 | 22.452 |
| 4.189538516777778 | 22.452 |
| 4.192598969611112 | 22.452 |
| 4.195661367 | 22.452 |
| 4.198720708638889 | 22.441 |
| 4.201780328083333 | 22.452 |
| 4.204840503111111 | 22.452 |
| 4.207900400361111 | 22.441 |
| 4.210962519944444 | 22.441 |
| 4.214026306305556 | 22.441 |
| 4.217087314694444 | 22.452 |
| 4.220146934138889 | 22.431 |
| 4.223211831666667 | 22.431 |
| 4.226275895805555 | 22.441 |
| 4.2293391265833336 | 22.431 |
| 4.232399023805556 | 22.431 |
| 4.235458365472223 | 22.431 |
| 4.238518262722223 | 22.431 |
| 4.241582882444444 | 22.42 |
| 4.244642779666667 | 22.441 |
| 4.247701843527778 | 22.42 |
| 4.250763963111111 | 22.431 |
| 4.253826916083333 | 22.409 |
| 4.256887091111111 | 22.42 |
| 4.259958100111111 | 22.431 |
| 4.263019108527778 | 22.409 |
| 4.26608372825 | 22.42 |
| 4.269147792388889 | 22.431 |
| 4.272207689638889 | 22.42 |
| 4.2752720315833335 | 22.42 |
| 4.278332762194444 | 22.409 |
| 4.2814073825 | 22.42 |
| 4.284469224277778 | 22.42 |
| 4.287529121527777 | 22.42 |
| 4.290597630361112 | 22.42 |
| 4.293659749944444 | 22.42 |
| 4.296724647472222 | 22.388 |
| 4.2997864892777775 | 22.409 |
| 4.302851664583334 | 22.409 |
| 4.305911561833333 | 22.409 |
| 4.308971736861111 | 22.399 |
| 4.312035523222223 | 22.399 |
| 4.315096809416667 | 22.399 |
| 4.31815726225 | 22.42 |
| 4.321217715055555 | 22.409 |
| 4.3242784456944445 | 22.388 |
| 4.327339731888889 | 22.388 |
| 4.330407129555556 | 22.388 |
| 4.333467026805556 | 22.399 |
| 4.336526368444445 | 22.409 |
| 4.339587376861111 | 22.399 |
| 4.342654218944444 | 22.377 |
| 4.3457146717777775 | 22.399 |
| 4.3487770691388885 | 22.388 |
| 4.351843355638889 | 22.388 |
| 4.354902697305556 | 22.399 |
| 4.357962872333333 | 22.399 |
| 4.361025825305555 | 22.388 |
| 4.364092945166666 | 22.399 |
| 4.367152286833334 | 22.388 |
| 4.370218573305555 | 22.366 |
| 4.373279303944444 | 22.366 |
| 4.376340034555556 | 22.388 |
| 4.379408821194445 | 22.399 |
| 4.382476496638889 | 22.356 |
| 4.385536116083333 | 22.388 |
| 4.3885987912777775 | 22.388 |
| 4.391660355277778 | 22.388 |
| 4.394723030444444 | 22.377 |
| 4.397782372083333 | 22.366 |
| 4.400843936083334 | 22.377 |
| 4.403905222305555 | 22.377 |
| 4.406965397333334 | 22.399 |
| 4.410025850166667 | 22.366 |
| 4.413085191805556 | 22.377 |
| 4.41614481125 | 22.377 |
| 4.419204986277777 | 22.377 |
| 4.422264050138889 | 22.377 |
| 4.425323947388889 | 22.377 |
| 4.428390233888889 | 22.366 |
| 4.431457631555555 | 22.377 |
| 4.4345169731944445 | 22.377 |
| 4.437582426305555 | 22.366 |
| 4.440642601333334 | 22.366 |
| 4.4437038875555555 | 22.377 |
| 4.446772396388889 | 22.377 |
| 4.449846183305556 | 22.377 |
| 4.452910803027778 | 22.366 |
| 4.455971533666667 | 22.377 |
| 4.459030875305555 | 22.388 |
| 4.462092994888889 | 22.388 |
| 4.465152892138889 | 22.366 |
| 4.468215845111112 | 22.388 |
| 4.471277686888889 | 22.388 |
| 4.474344528972222 | 22.377 |
| 4.4774041484166665 | 22.388 |
| 4.480465434638889 | 22.399 |
| 4.483527276416667 | 22.388 |
| 4.48658772925 | 22.388 |
| 4.4896476265 | 22.377 |
| 4.492707523722222 | 22.399 |
| 4.495767143166667 | 22.377 |
| 4.4988325962777775 | 22.388 |
| 4.501893326888889 | 22.399 |
| 4.504956835444444 | 22.399 |
| 4.508016454888889 | 22.409 |
| 4.511075796555556 | 22.409 |
| 4.514140971861111 | 22.409 |
| 4.5172005913055555 | 22.42 |
| 4.52026021075 | 22.431 |
| 4.52332177475 | 22.441 |
| 4.526384727722222 | 22.409 |
| 4.529446013944445 | 22.409 |
| 4.532507855722222 | 22.431 |
| 4.535569975305555 | 22.431 |
| 4.53863431725 | 22.452 |
| 4.541697548027778 | 22.409 |
| 4.54475744525 | 22.431 |
| 4.5478173425 | 22.452 |
| 4.550879739861111 | 22.431 |
| 4.553939359305555 | 22.431 |
| 4.55699897875 | 22.463 |
| 4.560059709388889 | 22.431 |
| 4.563123773527777 | 22.452 |
| 4.566184781944444 | 22.452 |
| 4.569244679166667 | 22.431 |
| 4.572304298611111 | 22.452 |
| 4.575363918055555 | 22.452 |
| 4.578424370888889 | 22.452 |
| 4.581483712555556 | 22.452 |
| 4.584544165361112 | 22.463 |
| 4.587604062611111 | 22.441 |
| 4.590667015583334 | 22.452 |
| 4.593728579583334 | 22.473 |
| 4.596788754611111 | 22.463 |
| 4.599850318611112 | 22.463 |
| 4.602911882611111 | 22.452 |
| 4.605979558083333 | 22.473 |
| 4.609046122361112 | 22.463 |
| 4.612109353111111 | 22.463 |
| 4.6151717505 | 22.463 |
| 4.618232758916666 | 22.463 |
| 4.621292378361111 | 22.452 |
| 4.624358664861111 | 22.463 |
| 4.6274213400277775 | 22.463 |
| 4.630484292999999 | 22.452 |
| 4.6335447458333325 | 22.452 |
| 4.636604365277778 | 22.463 |
| 4.639665095888889 | 22.441 |
| 4.6427258265 | 22.463 |
| 4.645786001527777 | 22.463 |
| 4.648845620972223 | 22.463 |
| 4.651904962638889 | 22.463 |
| 4.654964304277778 | 22.463 |
| 4.658024201527778 | 22.452 |
| 4.6610885434444445 | 22.431 |
| 4.664165663888889 | 22.452 |
| 4.667227505694444 | 22.473 |
| 4.670292681027778 | 22.473 |
| 4.673354522805555 | 22.452 |
| 4.676415253416667 | 22.452 |
| 4.679474595083334 | 22.452 |
| 4.6825375480555556 | 22.452 |
| 4.685598000861112 | 22.452 |
| 4.688660953833334 | 22.473 |
| 4.691720295500001 | 22.452 |
| 4.6947815816944445 | 22.463 |
| 4.697841756722223 | 22.452 |
| 4.70090193175 | 22.452 |
| 4.703962106805555 | 22.452 |
| 4.70702172625 | 22.441 |
| 4.710084401416666 | 22.452 |
| 4.713144298666667 | 22.431 |
| 4.7162041958888885 | 22.452 |
| 4.719266037694444 | 22.452 |
| 4.722326212722222 | 22.441 |
| 4.725399444055555 | 22.452 |
| 4.728461008055556 | 22.441 |
| 4.731520627499999 | 22.42 |
| 4.734582747083333 | 22.431 |
| 4.7376426443333335 | 22.431 |
| 4.740702541555556 | 22.42 |
| 4.743781328777779 | 22.452 |
| 4.746840948222222 | 22.441 |
| 4.749903901194445 | 22.452 |
| 4.752963520638889 | 22.409 |
| 4.756023417861111 | 22.441 |
| 4.759084981861111 | 22.42 |
| 4.7621471014444445 | 22.452 |
| 4.765206720888889 | 22.42 |
| 4.7682674515277785 | 22.42 |
| 4.771328182138888 | 22.42 |
| 4.774395301999999 | 22.431 |
| 4.7774557548333325 | 22.431 |
| 4.780519541194444 | 22.42 |
| 4.783579160638889 | 22.441 |
| 4.78663989125 | 22.441 |
| 4.789710066861112 | 22.42 |
| 4.792769964083333 | 22.409 |
| 4.7958295835277776 | 22.42 |
| 4.798891147527778 | 22.431 |
| 4.801951878166666 | 22.42 |
| 4.805011775388889 | 22.431 |
| 4.808074450583334 | 22.399 |
| 4.8111335144166665 | 22.409 |
| 4.814199800916667 | 22.42 |
| 4.81726025375 | 22.399 |
| 4.820322095527778 | 22.42 |
| 4.823381992777778 | 22.399 |
| 4.826454390722223 | 22.409 |
| 4.8295176215 | 22.399 |
| 4.832583630194444 | 22.399 |
| 4.835648249916667 | 22.409 |
| 4.838710925111111 | 22.399 |
| 4.841777489388889 | 22.399 |
| 4.844840720138889 | 22.42 |
| 4.847901728555556 | 22.399 |
| 4.850961347999999 | 22.409 |
| 4.85402124525 | 22.42 |
| 4.857081975861112 | 22.399 |
| 4.8601515958888895 | 22.399 |
| 4.8632109375277786 | 22.388 |
| 4.866271668138889 | 22.377 |
| 4.869334343333334 | 22.399 |
| 4.872396185111111 | 22.409 |
| 4.875460527055556 | 22.377 |
| 4.878522368861111 | 22.388 |
| 4.881583655055556 | 22.399 |
| 4.884646330222222 | 22.388 |
| 4.8877112277500006 | 22.377 |
| 4.890773347333334 | 22.388 |
| 4.893832966777778 | 22.399 |
| 4.896895364166666 | 22.366 |
| 4.899955539194444 | 22.399 |
| 4.9030151586388895 | 22.409 |
| 4.9060745003055555 | 22.399 |
| 4.909137453277778 | 22.377 |
| 4.912234297055555 | 22.377 |
| 4.915293638722223 | 22.377 |
| 4.918354647138888 | 22.377 |
| 4.921417600083333 | 22.377 |
| 4.92447694175 | 22.366 |
| 4.927537950166666 | 22.377 |
| 4.93060006975 | 22.366 |
| 4.933661355944444 | 22.356 |
| 4.936723475527778 | 22.377 |
| 4.939783094972222 | 22.377 |
| 4.942842158833334 | 22.366 |
| 4.9459034450555555 | 22.377 |
| 4.948963342277779 | 22.366 |
| 4.952033795694445 | 22.377 |
| 4.9550942485 | 22.356 |
| 4.958153867944445 | 22.377 |
| 4.9612132096111115 | 22.388 |
| 4.964272829055555 | 22.356 |
| 4.967333559666667 | 22.377 |
| 4.970394845888889 | 22.366 |
| 4.973455020916667 | 22.356 |
| 4.976514362555556 | 22.356 |
| 4.979575648777778 | 22.377 |
| 4.982638879527778 | 22.377 |
| 4.9856998879444445 | 22.366 |
| 4.988760618555555 | 22.377 |
| 4.991820515805555 | 22.356 |
| 4.99488902463889 | 22.356 |
| 4.997951422027778 | 22.356 |
| 5.001012986027778 | 22.366 |
| 5.004075105611111 | 22.345 |
| 5.007145836805555 | 22.356 |
| 5.010211567694444 | 22.334 |
| 5.0132734095 | 22.366 |
| 5.016332751138889 | 22.356 |
| 5.019392092805556 | 22.356 |
| 5.022455045777778 | 22.356 |
| 5.0255196655 | 22.345 |
| 5.028579284944445 | 22.356 |
| 5.031640848944445 | 22.366 |
| 5.034706302055555 | 22.334 |
| 5.037766477083333 | 22.366 |
| 5.040825818749999 | 22.345 |
| 5.043885160388888 | 22.345 |
| 5.046948668944444 | 22.356 |
| 5.050008010611111 | 22.345 |
| 5.053072352527778 | 22.366 |
| 5.056132805361111 | 22.356 |
| 5.059193258194445 | 22.356 |
| 5.062253988805556 | 22.345 |
| 5.0653152750277775 | 22.356 |
| 5.068377394611111 | 22.356 |
| 5.07143673625 | 22.366 |
| 5.074496077916667 | 22.356 |
| 5.077555975138889 | 22.334 |
| 5.080615594583334 | 22.377 |
| 5.083677991972222 | 22.356 |
| 5.086739555972223 | 22.366 |
| 5.089808342611112 | 22.356 |
| 5.092869351027777 | 22.366 |
| 5.095931192805556 | 22.356 |
| 5.098994979166667 | 22.366 |
| 5.102058209916667 | 22.356 |
| 5.105118107166667 | 22.366 |
| 5.108184115861111 | 22.377 |
| 5.111244846472222 | 22.356 |
| 5.1143050215 | 22.377 |
| 5.1173663077222225 | 22.377 |
| 5.120429538472222 | 22.399 |
| 5.123489991305556 | 22.388 |
| 5.126550166333333 | 22.388 |
| 5.129610619166667 | 22.377 |
| 5.13267357213889 | 22.399 |
| 5.135732913777778 | 22.377 |
| 5.1387994780833335 | 22.399 |
| 5.141859375305556 | 22.399 |
| 5.144923439444445 | 22.409 |
| 5.147986392416667 | 22.431 |
| 5.151046289666667 | 22.409 |
| 5.154105909111111 | 22.42 |
| 5.157165528555556 | 22.409 |
| 5.16022681475 | 22.409 |
| 5.1632867120000006 | 22.399 |
| 5.166347442611111 | 22.42 |
| 5.169409284416667 | 22.42 |
| 5.172468626055556 | 22.42 |
| 5.175527689916667 | 22.441 |
| 5.178587864944444 | 22.42 |
| 5.181649428944445 | 22.409 |
| 5.184709603972223 | 22.431 |
| 5.187769223416667 | 22.441 |
| 5.190828287277777 | 22.42 |
| 5.193887906722223 | 22.452 |
| 5.196947803972222 | 22.441 |
| 5.200007145611111 | 22.42 |
| 5.203071765333333 | 22.441 |
| 5.206131940388889 | 22.431 |
| 5.209191004222221 | 22.463 |
| 5.212253957194444 | 22.452 |
| 5.21531413225 | 22.463 |
| 5.218374307277777 | 22.441 |
| 5.221437538027778 | 22.431 |
| 5.224496879694444 | 22.431 |
| 5.227556776916667 | 22.441 |
| 5.230620563277778 | 22.441 |
| 5.23368351625 | 22.431 |
| 5.236746469194444 | 22.452 |
| 5.239808311 | 22.441 |
| 5.2428679304444445 | 22.452 |
| 5.245930327833333 | 22.431 |
| 5.248998558888888 | 22.431 |
| 5.2520592895 | 22.452 |
| 5.255122242472223 | 22.42 |
| 5.258192418055556 | 22.441 |
| 5.261251759722222 | 22.431 |
| 5.264311379166666 | 22.431 |
| 5.2673782212499995 | 22.431 |
| 5.2704406186111115 | 22.42 |
| 5.2735057939444445 | 22.431 |
| 5.276568469111111 | 22.42 |
| 5.279627810777777 | 22.42 |
| 5.282687430222222 | 22.42 |
| 5.2857484386388895 | 22.452 |
| 5.288807780277779 | 22.431 |
| 5.291871566638888 | 22.431 |
| 5.294931463861111 | 22.431 |
| 5.297991638888889 | 22.42 |
| 5.301059869944444 | 22.452 |
| 5.3041283787777775 | 22.441 |
| 5.307189942777778 | 22.42 |
| 5.310254006944445 | 22.42 |
| 5.313318904444444 | 22.409 |
| 5.316379357277778 | 22.42 |
| 5.319441199083333 | 22.42 |
| 5.322501651888889 | 22.431 |
| 5.325564327083334 | 22.42 |
| 5.328623668722222 | 22.42 |
| 5.3316868995 | 22.42 |
| 5.334752352611111 | 22.409 |
| 5.337814472194445 | 22.409 |
| 5.3408765917777785 | 22.431 |
| 5.343938711361112 | 22.409 |
| 5.347007498 | 22.409 |
| 5.350069617583333 | 22.42 |
| 5.35312895925 | 22.409 |
| 5.356189967638889 | 22.42 |
| 5.359250698277778 | 22.399 |
| 5.362311706694444 | 22.399 |
| 5.365373548472222 | 22.42 |
| 5.368433167916667 | 22.399 |
| 5.371493065166667 | 22.399 |
| 5.3745537957777785 | 22.409 |
| 5.377613415222222 | 22.399 |
| 5.380673312472222 | 22.399 |
| 5.383735709833333 | 22.399 |
| 5.386795329277778 | 22.409 |
| 5.389857171083333 | 22.399 |
| 5.392917901694444 | 22.409 |
| 5.395979465694444 | 22.399 |
| 5.399042140888889 | 22.399 |
| 5.402101482527778 | 22.399 |
| 5.405160824166667 | 22.388 |
| 5.40823711125 | 22.399 |
| 5.411297286277778 | 22.388 |
| 5.4143716287777774 | 22.399 |
| 5.417432081611111 | 22.366 |
| 5.42049142325 | 22.399 |
| 5.423550487111111 | 22.388 |
| 5.426611495527778 | 22.388 |
| 5.429671670555556 | 22.377 |
| 5.432733234555555 | 22.399 |
| 5.435793687388888 | 22.388 |
| 5.438853584638889 | 22.366 |
| 5.441913204083333 | 22.377 |
| 5.444976434833333 | 22.377 |
| 5.448035498694444 | 22.388 |
| 5.451094840333333 | 22.388 |
| 5.454160015666666 | 22.366 |
| 5.457227413333333 | 22.388 |
| 5.460290644083333 | 22.366 |
| 5.4633549860277775 | 22.356 |
| 5.4664148832777775 | 22.377 |
| 5.469476725055556 | 22.388 |
| 5.472536622305555 | 22.399 |
| 5.4755976307222225 | 22.377 |
| 5.478665306166667 | 22.377 |
| 5.481725759 | 22.366 |
| 5.484791212111111 | 22.356 |
| 5.487851942722222 | 22.356 |
| 5.490911562166667 | 22.366 |
| 5.493971459416667 | 22.377 |
| 5.497032467833334 | 22.366 |
| 5.50009347625 | 22.366 |
| 5.503155318027778 | 22.366 |
| 5.506214381888889 | 22.356 |
| 5.509274556916667 | 22.366 |
| 5.5123372320833335 | 22.356 |
| 5.515396295944444 | 22.345 |
| 5.5184611934722225 | 22.366 |
| 5.521526091 | 22.356 |
| 5.524587377222222 | 22.345 |
| 5.527650607972222 | 22.356 |
| 5.530711338583334 | 22.356 |
| 5.533771235833333 | 22.366 |
| 5.536831966444445 | 22.356 |
| 5.539904086611112 | 22.334 |
| 5.542964817222222 | 22.356 |
| 5.546030270333333 | 22.356 |
| 5.549091834333334 | 22.345 |
| 5.552151453777777 | 22.356 |
| 5.555213573361111 | 22.356 |
| 5.558285137944444 | 22.356 |
| 5.561345868555556 | 22.356 |
| 5.564414933 | 22.345 |
| 5.567476774777778 | 22.334 |
| 5.570536672027777 | 22.345 |
| 5.573596847055556 | 22.356 |
| 5.576655910916667 | 22.334 |
| 5.579721364027777 | 22.356 |
| 5.5827815390555555 | 22.334 |
| 5.5858411585 | 22.334 |
| 5.588901889111111 | 22.345 |
| 5.591962341944444 | 22.345 |
| 5.595022239194445 | 22.345 |
| 5.598083525388889 | 22.324 |
| 5.6011442559999995 | 22.334 |
| 5.60420415325 | 22.345 |
| 5.607267939611111 | 22.345 |
| 5.610330336972222 | 22.334 |
| 5.613391067611111 | 22.345 |
| 5.61645040925 | 22.324 |
| 5.61951197325 | 22.324 |
| 5.622571592694444 | 22.313 |
| 5.6256334345 | 22.334 |
| 5.628693053944445 | 22.324 |
| 5.631752395583333 | 22.345 |
| 5.634815348555556 | 22.324 |
| 5.637874968 | 22.356 |
| 5.640935976416666 | 22.334 |
| 5.644000318361111 | 22.356 |
| 5.64706132675 | 22.345 |
| 5.650120668416666 | 22.356 |
| 5.653180010055555 | 22.345 |
| 5.6562415740555565 | 22.334 |
| 5.659301749111112 | 22.334 |
| 5.662363035305555 | 22.356 |
| 5.665425154888888 | 22.366 |
| 5.668485329916667 | 22.356 |
| 5.671544671583333 | 22.345 |
| 5.6746054021944445 | 22.356 |
| 5.677665021638889 | 22.377 |
| 5.680724641083333 | 22.366 |
| 5.6837856495 | 22.366 |
| 5.686847769083333 | 22.388 |
| 5.689916000138889 | 22.356 |
| 5.692975619583334 | 22.377 |
| 5.696036350194444 | 22.388 |
| 5.699095969638889 | 22.366 |
| 5.702155866888889 | 22.388 |
| 5.705216875305555 | 22.377 |
| 5.708280661638889 | 22.409 |
| 5.711345836972222 | 22.388 |
| 5.714422401805555 | 22.377 |
| 5.71748202125 | 22.388 |
| 5.720544418638889 | 22.388 |
| 5.723607927194444 | 22.399 |
| 5.726668102222222 | 22.409 |
| 5.729728832861111 | 22.388 |
| 5.732792063611111 | 22.399 |
| 5.735851960861112 | 22.409 |
| 5.738917136166667 | 22.42 |
| 5.741977311194445 | 22.409 |
| 5.745036652861112 | 22.409 |
| 5.748101550388889 | 22.399 |
| 5.751162003194445 | 22.399 |
| 5.754221622638889 | 22.42 |
| 5.757281242083333 | 22.399 |
| 5.760342528305556 | 22.409 |
| 5.763416593027777 | 22.399 |
| 5.766477045833333 | 22.441 |
| 5.7695394432222225 | 22.42 |
| 5.77260045163889 | 22.409 |
| 5.775659793277778 | 22.431 |
| 5.778720801694444 | 22.431 |
| 5.781781810111111 | 22.409 |
| 5.78484115175 | 22.42 |
| 5.7879038269444445 | 22.431 |
| 5.790980669583333 | 22.42 |
| 5.79404001125 | 22.42 |
| 5.797099075111111 | 22.441 |
| 5.800159527916667 | 22.42 |
| 5.80321998075 | 22.42 |
| 5.806285156055555 | 22.431 |
| 5.809346164472222 | 22.399 |
| 5.812407172888888 | 22.42 |
| 5.815469570277777 | 22.431 |
| 5.818533634416666 | 22.42 |
| 5.8215968651944445 | 22.42 |
| 5.824660929333334 | 22.42 |
| 5.827720826555556 | 22.409 |
| 5.830788779805555 | 22.42 |
| 5.833850066027778 | 22.431 |
| 5.836910796638889 | 22.431 |
| 5.8399731940277775 | 22.42 |
| 5.843036146999999 | 22.42 |
| 5.846101044527778 | 22.42 |
| 5.849160663972222 | 22.42 |
| 5.852219727805555 | 22.409 |
| 5.855280180638888 | 22.42 |
| 5.8583417446388895 | 22.431 |
| 5.861403586444444 | 22.431 |
| 5.864463761472222 | 22.431 |
| 5.867525881055555 | 22.409 |
| 5.870588278444444 | 22.42 |
| 5.8736509536111114 | 22.42 |
| 5.876710017472223 | 22.42 |
| 5.8797701925000005 | 22.42 |
| 5.882830367527777 | 22.431 |
| 5.885890542555555 | 22.409 |
| 5.88895071761111 | 22.409 |
| 5.8920147817499995 | 22.42 |
| 5.895074956777778 | 22.399 |
| 5.898138465333334 | 22.42 |
| 5.901199751527778 | 22.42 |
| 5.904259093194445 | 22.42 |
| 5.907318990416667 | 22.409 |
| 5.9103780542777775 | 22.399 |
| 5.913437951527778 | 22.42 |
| 5.916498126555555 | 22.409 |
| 5.919558857166667 | 22.399 |
| 5.92262097675 | 22.409 |
| 5.925681707388889 | 22.409 |
| 5.928749105055555 | 22.399 |
| 5.931808446694444 | 22.399 |
| 5.9348700106944445 | 22.388 |
| 5.9379293523611105 | 22.388 |
| 5.941008972944444 | 22.377 |
| 5.944068592388889 | 22.399 |
| 5.947134323277778 | 22.409 |
| 5.9501944983333335 | 22.399 |
| 5.953263840555556 | 22.377 |
| 5.956326237916667 | 22.399 |
| 5.95939308 | 22.409 |
| 5.9624526994444444 | 22.399 |
| 5.96551204111111 | 22.377 |
| 5.968572771722222 | 22.388 |
| 5.971637113666667 | 22.399 |
| 5.974697288694444 | 22.377 |
| 5.977756352555556 | 22.399 |
| 5.980818194333333 | 22.388 |
| 5.983877258194444 | 22.409 |
| 5.9869391 | 22.377 |
| 5.989998997222222 | 22.388 |
| 5.993059450055555 | 22.377 |
| 5.996118791722223 | 22.399 |
| 5.999179244527778 | 22.399 |
| 6.002241086333333 | 22.377 |
| 6.005300705777778 | 22.366 |
| 6.008367825638889 | 22.366 |
| 6.0114277228888895 | 22.388 |
| 6.014488175722223 | 22.377 |
| 6.017551962055555 | 22.377 |
| 6.020612970472222 | 22.377 |
| 6.023677312416667 | 22.366 |
| 6.026738043027778 | 22.399 |
| 6.02980266275 | 22.377 |
| 6.032863393388888 | 22.377 |
| 6.035923568416667 | 22.356 |
| 6.038982910055555 | 22.366 |
| 6.0420514189166665 | 22.366 |
| 6.045117427611111 | 22.356 |
| 6.048178158222223 | 22.377 |
| 6.051239166638888 | 22.356 |
| 6.054298508277777 | 22.366 |
| 6.057358405527778 | 22.377 |
| 6.060423303055556 | 22.366 |
| 6.06348458925 | 22.366 |
| 6.066548375611111 | 22.356 |
| 6.069609106222222 | 22.377 |
| 6.0726687256666665 | 22.356 |
| 6.075732512027778 | 22.356 |
| 6.07879240925 | 22.366 |
| 6.0818523065 | 22.377 |
| 6.084914703888889 | 22.356 |
| 6.087974323333333 | 22.356 |
| 6.091036442916667 | 22.334 |
| 6.094097451333334 | 22.356 |
| 6.097159293111111 | 22.356 |
| 6.100220023722223 | 22.356 |
| 6.103280476555556 | 22.366 |
| 6.106342596138889 | 22.356 |
| 6.109404993527778 | 22.356 |
| 6.112465446361111 | 22.345 |
| 6.115528399333333 | 22.356 |
| 6.118591907888889 | 22.345 |
| 6.121651805111111 | 22.356 |
| 6.124714480305555 | 22.366 |
| 6.1277749331111115 | 22.334 |
| 6.130836219333333 | 22.356 |
| 6.133898338916667 | 22.356 |
| 6.136959069527777 | 22.356 |
| 6.140022855888889 | 22.356 |
| 6.143083030916666 | 22.356 |
| 6.146142650361112 | 22.356 |
| 6.149204492166667 | 22.345 |
| 6.152263833805556 | 22.324 |
| 6.155323731055556 | 22.356 |
| 6.158385572833333 | 22.324 |
| 6.161445470083334 | 22.345 |
| 6.164505089527777 | 22.334 |
| 6.167573598361111 | 22.334 |
| 6.170633217805555 | 22.334 |
| 6.17369283725 | 22.356 |
| 6.1767527345 | 22.356 |
| 6.179812909527778 | 22.345 |
| 6.182873084555555 | 22.334 |
| 6.185932704 | 22.324 |
| 6.1889934346111115 | 22.334 |
| 6.192058887722222 | 22.356 |
| 6.195124063055556 | 22.356 |
| 6.1981836825 | 22.345 |
| 6.201246635472223 | 22.334 |
| 6.204305977111112 | 22.356 |
| 6.207365040972221 | 22.324 |
| 6.210424660416667 | 22.356 |
| 6.213493447055556 | 22.345 |
| 6.216553344277777 | 22.345 |
| 6.219612963722223 | 22.334 |
| 6.222672860972222 | 22.366 |
| 6.225734424972223 | 22.345 |
| 6.228800155888889 | 22.366 |
| 6.231866720166667 | 22.345 |
| 6.234929117555555 | 22.366 |
| 6.237988459194444 | 22.366 |
| 6.241049189805556 | 22.356 |
| 6.2441085314722224 | 22.377 |
| 6.247168150916666 | 22.356 |
| 6.250227492555555 | 22.388 |
| 6.253288500972222 | 22.356 |
| 6.256348120416667 | 22.345 |
| 6.259411351194445 | 22.388 |
| 6.2624712484166665 | 22.388 |
| 6.2655347569722215 | 22.388 |
| 6.268594654222222 | 22.366 |
| 6.271661774083333 | 22.366 |
| 6.274721671333333 | 22.409 |
| 6.2777957360277785 | 22.377 |
| 6.280855355472222 | 22.377 |
| 6.283920808611112 | 22.377 |
| 6.286980150250001 | 22.388 |
| 6.2900419920555555 | 22.388 |
| 6.2931016115 | 22.399 |
| 6.2961631755 | 22.409 |
| 6.299225295083334 | 22.399 |
| 6.302289637 | 22.409 |
| 6.305348978666666 | 22.409 |
| 6.308408320305555 | 22.409 |
| 6.311469050944445 | 22.409 |
| 6.3145325595 | 22.409 |
| 6.317594679083333 | 22.409 |
| 6.320654298527778 | 22.388 |
| 6.323713917972222 | 22.409 |
| 6.326779093277778 | 22.399 |
| 6.3298389905277785 | 22.399 |
| 6.332899998944444 | 22.42 |
| 6.335962951916667 | 22.399 |
| 6.3390250715 | 22.42 |
| 6.342085524305555 | 22.431 |
| 6.345150699638889 | 22.399 |
| 6.348219486277778 | 22.431 |
| 6.351280494694444 | 22.409 |
| 6.354340391916667 | 22.399 |
| 6.3574025115 | 22.42 |
| 6.360463797722222 | 22.42 |
| 6.363524250555555 | 22.431 |
| 6.36658387 | 22.409 |
| 6.369644045027777 | 22.399 |
| 6.3727067201944445 | 22.42 |
| 6.375766061833334 | 22.42 |
| 6.378830959361111 | 22.399 |
| 6.381890578805556 | 22.399 |
| 6.384950198249999 | 22.399 |
| 6.388009817694445 | 22.399 |
| 6.39107332625 | 22.409 |
| 6.394133779083333 | 22.409 |
| 6.397196176472223 | 22.409 |
| 6.400261074 | 22.399 |
| 6.4033209712222225 | 22.409 |
| 6.406385313166666 | 22.409 |
| 6.409446877166666 | 22.409 |
| 6.412508441166667 | 22.409 |
| 6.415574727666667 | 22.399 |
| 6.418634624888889 | 22.42 |
| 6.421695355527778 | 22.399 |
| 6.424754419388889 | 22.409 |
| 6.4278154277777775 | 22.388 |
| 6.430879491944444 | 22.399 |
| 6.4339393891666665 | 22.377 |
| 6.437003453305556 | 22.399 |
| 6.440064183944444 | 22.399 |
| 6.443124358972222 | 22.388 |
| 6.446183978416667 | 22.399 |
| 6.449243597861111 | 22.388 |
| 6.452302661722222 | 22.388 |
| 6.455362281166667 | 22.377 |
| 6.458424956333333 | 22.399 |
| 6.461484575777778 | 22.399 |
| 6.4645441952222225 | 22.399 |
| 6.467604925833333 | 22.399 |
| 6.470668989972221 | 22.388 |
| 6.473745554833333 | 22.388 |
| 6.47680656325 | 22.399 |
| 6.479865904916667 | 22.377 |
| 6.482929413472222 | 22.409 |
| 6.485990699666666 | 22.388 |
| 6.489050596916667 | 22.377 |
| 6.492111605305556 | 22.388 |
| 6.495170946972222 | 22.388 |
| 6.498232788777777 | 22.377 |
| 6.501294074972222 | 22.388 |
| 6.504357027944444 | 22.377 |
| 6.507416647388889 | 22.377 |
| 6.510480989333334 | 22.377 |
| 6.513540608777777 | 22.399 |
| 6.516602450555555 | 22.399 |
| 6.519669570444444 | 22.388 |
| 6.5227291898888895 | 22.377 |
| 6.525789087111111 | 22.377 |
| 6.528849262138889 | 22.366 |
| 6.531908326000001 | 22.377 |
| 6.534971001194444 | 22.388 |
| 6.538031731805556 | 22.366 |
| 6.541109963416667 | 22.377 |
| 6.544170694027778 | 22.366 |
| 6.547235869361112 | 22.366 |
| 6.5502960443888885 | 22.377 |
| 6.553356775 | 22.356 |
| 6.556416394444445 | 22.356 |
| 6.55947823625 | 22.356 |
| 6.562538133472222 | 22.377 |
| 6.565597475138889 | 22.366 |
| 6.568657372388889 | 22.356 |
| 6.571716991833333 | 22.366 |
| 6.574777722444445 | 22.366 |
| 6.577838730861111 | 22.356 |
| 6.580900850444444 | 22.356 |
| 6.583962414444445 | 22.356 |
| 6.587026200777778 | 22.356 |
| 6.5900972097777775 | 22.345 |
| 6.593157662611111 | 22.356 |
| 6.596220615555556 | 22.345 |
| 6.5992846797222215 | 22.356 |
| 6.602346243722223 | 22.356 |
| 6.605406140944444 | 22.356 |
| 6.6084668715833335 | 22.334 |
| 6.611526213222223 | 22.356 |
| 6.614585554861112 | 22.345 |
| 6.617649896805555 | 22.356 |
| 6.620712294194444 | 22.345 |
| 6.623774691583334 | 22.366 |
| 6.626837644527778 | 22.356 |
| 6.6298989307500005 | 22.356 |
| 6.632958272388889 | 22.356 |
| 6.636017891833333 | 22.356 |
| 6.639078344666666 | 22.356 |
| 6.642162132166667 | 22.345 |
| 6.6452228627777785 | 22.324 |
| 6.648282760027778 | 22.356 |
| 6.65134737975 | 22.334 |
| 6.654409221555556 | 22.334 |
| 6.657469118777778 | 22.356 |
| 6.6605320717500005 | 22.345 |
| 6.6635955803055555 | 22.356 |
| 6.666659366666667 | 22.345 |
| 6.669719541694445 | 22.345 |
| 6.672779716722222 | 22.345 |
| 6.675839336166667 | 22.324 |
| 6.6788995111944445 | 22.324 |
| 6.681960797416666 | 22.334 |
| 6.685020694638889 | 22.324 |
| 6.688081147472222 | 22.356 |
| 6.691140766916666 | 22.345 |
| 6.694203164305556 | 22.334 |
| 6.6972727843055555 | 22.334 |
| 6.700336570666666 | 22.334 |
| 6.7033967456944445 | 22.324 |
| 6.7064566429444445 | 22.345 |
| 6.709515984583334 | 22.334 |
| 6.712579770944445 | 22.324 |
| 6.715639112583333 | 22.324 |
| 6.718700954388889 | 22.334 |
| 6.721761962777778 | 22.345 |
| 6.724821304444444 | 22.345 |
| 6.7278812016666665 | 22.356 |
| 6.730942487888889 | 22.356 |
| 6.734004051888889 | 22.345 |
| 6.737067282638889 | 22.334 |
| 6.740126902083333 | 22.345 |
| 6.743186799333333 | 22.345 |
| 6.746248085527778 | 22.356 |
| 6.749308260583334 | 22.356 |
| 6.752367880027777 | 22.334 |
| 6.755436111055555 | 22.366 |
| 6.758502953138889 | 22.345 |
| 6.761566461694445 | 22.356 |
| 6.764626081138888 | 22.366 |
| 6.76769153425 | 22.345 |
| 6.770750875916667 | 22.366 |
| 6.7738129955 | 22.366 |
| 6.776884560055556 | 22.366 |
| 6.77994723525 | 22.366 |
| 6.783007132472222 | 22.356 |
| 6.786069529861111 | 22.399 |
| 6.789129149305555 | 22.399 |
| 6.792208769888888 | 22.366 |
| 6.795273389638889 | 22.388 |
| 6.798333009083333 | 22.377 |
| 6.801393461888888 | 22.399 |
| 6.8044541925277775 | 22.388 |
| 6.807513811972222 | 22.377 |
| 6.810573431416667 | 22.366 |
| 6.813632773055556 | 22.377 |
| 6.8166940592500005 | 22.377 |
| 6.819753678694444 | 22.388 |
| 6.822818576222223 | 22.409 |
| 6.825877917888889 | 22.399 |
| 6.828939204083333 | 22.399 |
| 6.831999101333333 | 22.388 |
| 6.835060665333334 | 22.409 |
| 6.838125840638889 | 22.399 |
| 6.841192404944445 | 22.399 |
| 6.844253968944444 | 22.399 |
| 6.847313310583333 | 22.399 |
| 6.8503723744444445 | 22.409 |
| 6.8534406055 | 22.399 |
| 6.8564999471388886 | 22.42 |
| 6.8595603999722226 | 22.409 |
| 6.86262140838889 | 22.399 |
| 6.865681305611111 | 22.399 |
| 6.868743703 | 22.399 |
| 6.8718061003888895 | 22.399 |
| 6.874866831 | 22.399 |
| 6.87792672825 | 22.377 |
| 6.88098829225 | 22.388 |
| 6.884051800805555 | 22.409 |
| 6.887111698027778 | 22.399 |
| 6.890171039694445 | 22.399 |
| 6.893230381333333 | 22.409 |
| 6.896292778722222 | 22.409 |
| 6.899353231527777 | 22.377 |
| 6.902414795527778 | 22.409 |
| 6.905476637333334 | 22.399 |
| 6.908536256777778 | 22.409 |
| 6.9115961540277775 | 22.409 |
| 6.914657162444445 | 22.388 |
| 6.91772233775 | 22.409 |
| 6.920781401611111 | 22.399 |
| 6.923853521777778 | 22.399 |
| 6.926923975166667 | 22.42 |
| 6.929991372833333 | 22.399 |
| 6.933050436694445 | 22.399 |
| 6.936109778333333 | 22.399 |
| 6.939169675583334 | 22.409 |
| 6.9422659637777775 | 22.399 |
| 6.945331972472222 | 22.388 |
| 6.948391869722222 | 22.409 |
| 6.951452322555555 | 22.399 |
| 6.954511386416667 | 22.399 |
| 6.957570728055556 | 22.366 |
| 6.960638125722222 | 22.399 |
| 6.963715246166666 | 22.399 |
| 6.966776810166667 | 22.399 |
| 6.969843374444444 | 22.388 |
| 6.972903271694444 | 22.388 |
| 6.975965669083333 | 22.399 |
| 6.979042233944445 | 22.377 |
| 6.982243250361111 | 22.399 |
| 6.985309259055556 | 22.409 |
| 6.988371100861111 | 22.388 |
| 6.991432109250001 | 22.388 |
| 6.99449117311111 | 22.377 |
| 6.997550514777778 | 22.409 |
| 7.000611523194444 | 22.399 |
| 7.003671976 | 22.377 |
| 7.006732984416667 | 22.377 |
| 7.009792326083333 | 22.377 |
| 7.0128566679999995 | 22.377 |
| 7.015917398638889 | 22.377 |
| 7.018980073805556 | 22.366 |
| 7.022040248833334 | 22.399 |
| 7.025100146083333 | 22.366 |
| 7.028173377416667 | 22.366 |
| 7.031236052583334 | 22.399 |
| 7.034295672027778 | 22.377 |
| 7.037358069416666 | 22.388 |
| 7.0404185222499995 | 22.399 |
| 7.043478419472223 | 22.377 |
| 7.046543039194444 | 22.377 |
| 7.04960654775 | 22.356 |
| 7.052667556166667 | 22.377 |
| 7.05573912075 | 22.377 |
| 7.058807351805555 | 22.356 |
| 7.061867249027778 | 22.366 |
| 7.064930757583333 | 22.356 |
| 7.067991488222222 | 22.366 |
| 7.071056107944444 | 22.366 |
| 7.074127950305556 | 22.377 |
| 7.0771881253333335 | 22.366 |
| 7.080249133750001 | 22.356 |
| 7.083308753194444 | 22.345 |
| 7.086368928222223 | 22.356 |
| 7.08942910325 | 22.345 |
| 7.092490111666667 | 22.345 |
| 7.095563343 | 22.356 |
| 7.098623518027778 | 22.356 |
| 7.101685637638889 | 22.377 |
| 7.104744979277778 | 22.356 |
| 7.107806265472222 | 22.356 |
| 7.110865607138889 | 22.345 |
| 7.113927448916667 | 22.356 |
| 7.116987346166666 | 22.356 |
| 7.120048354583333 | 22.345 |
| 7.123109363 | 22.356 |
| 7.126168982444444 | 22.345 |
| 7.129230824222223 | 22.345 |
| 7.132290165888889 | 22.334 |
| 7.135352007666667 | 22.356 |
| 7.138412182722223 | 22.356 |
| 7.141475969055556 | 22.334 |
| 7.144535866305556 | 22.345 |
| 7.147601597194445 | 22.356 |
| 7.150664827972222 | 22.345 |
| 7.153723891833334 | 22.356 |
| 7.1567851780277785 | 22.324 |
| 7.159846186444444 | 22.356 |
| 7.162906083666667 | 22.345 |
| 7.165969036638889 | 22.334 |
| 7.169031156222222 | 22.345 |
| 7.172094664805555 | 22.356 |
| 7.175155395416667 | 22.345 |
| 7.178214737055556 | 22.324 |
| 7.18127741225 | 22.334 |
| 7.184338420638889 | 22.345 |
| 7.187398317888889 | 22.334 |
| 7.190457937333333 | 22.356 |
| 7.193519223527778 | 22.345 |
| 7.19658050975 | 22.334 |
| 7.199640129194444 | 22.324 |
| 7.202701693194444 | 22.324 |
| 7.2057615904166665 | 22.334 |
| 7.208836488527778 | 22.334 |
| 7.211898330333334 | 22.324 |
| 7.214960449916667 | 22.334 |
| 7.218019791555556 | 22.345 |
| 7.221079411 | 22.334 |
| 7.224139030444444 | 22.334 |
| 7.227204483555556 | 22.334 |
| 7.230273825777777 | 22.334 |
| 7.233335945361111 | 22.324 |
| 7.23639834275 | 22.334 |
| 7.239457962194445 | 22.324 |
| 7.242517303861111 | 22.324 |
| 7.245576923305555 | 22.334 |
| 7.248637376111111 | 22.324 |
| 7.251698940111112 | 22.324 |
| 7.2547596707499995 | 22.324 |
| 7.257820123555555 | 22.324 |
| 7.260879743 | 22.324 |
| 7.263942695972223 | 22.324 |
| 7.267003426583333 | 22.324 |
| 7.270065823972222 | 22.324 |
| 7.273125721222223 | 22.324 |
| 7.276187285222222 | 22.324 |
| 7.279248015833334 | 22.324 |
| 7.282310135416667 | 22.334 |
| 7.28537058825 | 22.324 |
| 7.2884327078333335 | 22.324 |
| 7.291496771972223 | 22.324 |
| 7.294558335972222 | 22.324 |
| 7.297619344388889 | 22.334 |
| 7.300681741777778 | 22.334 |
| 7.3037419168055555 | 22.345 |
| 7.306802369638889 | 22.334 |
| 7.309870322888889 | 22.356 |
| 7.312935498194444 | 22.334 |
| 7.315996784416667 | 22.324 |
| 7.319056959444445 | 22.345 |
| 7.322126023861111 | 22.324 |
| 7.325189254638889 | 22.356 |
| 7.328250263055556 | 22.356 |
| 7.331310715861111 | 22.345 |
| 7.334370057527778 | 22.356 |
| 7.337431343722222 | 22.356 |
| 7.340513186666667 | 22.345 |
| 7.343573917277778 | 22.356 |
| 7.346641037166666 | 22.356 |
| 7.349701767777778 | 22.366 |
| 7.352762220611111 | 22.356 |
| 7.355823784611111 | 22.366 |
| 7.358886459777778 | 22.356 |
| 7.3619483015833325 | 22.366 |
| 7.365009587777777 | 22.388 |
| 7.368071985166667 | 22.356 |
| 7.371131049027778 | 22.388 |
| 7.374206502694444 | 22.356 |
| 7.3772775116944445 | 22.388 |
| 7.380337408916667 | 22.366 |
| 7.383396472777777 | 22.366 |
| 7.386455814444445 | 22.356 |
| 7.389515433888889 | 22.399 |
| 7.392575886694445 | 22.377 |
| 7.395639673055556 | 22.388 |
| 7.398702903833334 | 22.388 |
| 7.401763078861111 | 22.399 |
| 7.404824642861111 | 22.388 |
| 7.407885095666667 | 22.388 |
| 7.410944715111111 | 22.388 |
| 7.414004056777778 | 22.366 |
| 7.417064787388889 | 22.409 |
| 7.420126629194445 | 22.399 |
| 7.423186526416666 | 22.399 |
| 7.426247534833333 | 22.399 |
| 7.429307154277778 | 22.388 |
| 7.432379274444444 | 22.377 |
| 7.435438616083333 | 22.377 |
| 7.438499902305556 | 22.399 |
| 7.441570355694444 | 22.399 |
| 7.444633308666667 | 22.409 |
| 7.447694317083333 | 22.388 |
| 7.450753380944444 | 22.388 |
| 7.453813833750001 | 22.377 |
| 7.456874286583334 | 22.409 |
| 7.459935017194445 | 22.409 |
| 7.462994081055555 | 22.399 |
| 7.4660556450555555 | 22.388 |
| 7.469131376555556 | 22.399 |
| 7.472204607888889 | 22.409 |
| 7.475265060694444 | 22.366 |
| 7.4783255135277775 | 22.42 |
| 7.481389855472222 | 22.399 |
| 7.4844489193333334 | 22.399 |
| 7.487509927722223 | 22.388 |
| 7.490577603194445 | 22.388 |
| 7.493641667333334 | 22.388 |
| 7.496704898111111 | 22.399 |
| 7.499765628722222 | 22.388 |
| 7.502825248166667 | 22.388 |
| 7.505887089972223 | 22.42 |
| 7.508949765138889 | 22.399 |
| 7.512009106777778 | 22.399 |
| 7.515069559611111 | 22.399 |
| 7.518132512583334 | 22.377 |
| 7.521192132027777 | 22.377 |
| 7.524252307055556 | 22.366 |
| 7.527319149138889 | 22.377 |
| 7.53037987975 | 22.366 |
| 7.533442277138889 | 22.399 |
| 7.536508008055556 | 22.377 |
| 7.539573738944445 | 22.399 |
| 7.542633080611111 | 22.399 |
| 7.545693533416667 | 22.399 |
| 7.548754264055555 | 22.399 |
| 7.551814716861111 | 22.388 |
| 7.554874614111111 | 22.366 |
| 7.557935344722223 | 22.377 |
| 7.560995797555556 | 22.377 |
| 7.564055972583334 | 22.366 |
| 7.56711614761111 | 22.366 |
| 7.570175767055556 | 22.388 |
| 7.573237608861111 | 22.377 |
| 7.576309173416666 | 22.366 |
| 7.57936962625 | 22.388 |
| 7.582428967916667 | 22.399 |
| 7.585488309555556 | 22.388 |
| 7.5885520959166675 | 22.377 |
| 7.591613104305555 | 22.356 |
| 7.5946738349444445 | 22.399 |
| 7.597736510111111 | 22.377 |
| 7.600798074111111 | 22.356 |
| 7.60385824913889 | 22.366 |
| 7.606918701972223 | 22.377 |
| 7.6099783214166665 | 22.377 |
| 7.613041829972222 | 22.377 |
| 7.616102838388889 | 22.377 |
| 7.619170791638888 | 22.366 |
| 7.622230133277777 | 22.356 |
| 7.625290863916667 | 22.356 |
| 7.628353816888889 | 22.366 |
| 7.631413991916667 | 22.356 |
| 7.634474444722223 | 22.356 |
| 7.637546842694444 | 22.366 |
| 7.640610351249999 | 22.356 |
| 7.6436713596666666 | 22.345 |
| 7.646730701305556 | 22.356 |
| 7.649791431916666 | 22.356 |
| 7.652850495777778 | 22.356 |
| 7.655910948611111 | 22.366 |
| 7.658973068194444 | 22.356 |
| 7.662037132333333 | 22.345 |
| 7.66509814075 | 22.356 |
| 7.668157760194444 | 22.345 |
| 7.671217657444444 | 22.356 |
| 7.6742797770277775 | 22.334 |
| 7.677339118666667 | 22.334 |
| 7.680404016194444 | 22.334 |
| 7.683478914305556 | 22.324 |
| 7.686538255944445 | 22.334 |
| 7.689599819944444 | 22.334 |
| 7.692663328499999 | 22.345 |
| 7.695727392638888 | 22.334 |
| 7.69878951225 | 22.334 |
| 7.701849965055556 | 22.334 |
| 7.704910695694444 | 22.334 |
| 7.707971426305556 | 22.313 |
| 7.711031323527778 | 22.334 |
| 7.714091220777778 | 22.324 |
| 7.717150562416667 | 22.324 |
| 7.720210737472223 | 22.334 |
| 7.723273134833334 | 22.345 |
| 7.726333032083333 | 22.324 |
| 7.7293937626944444 | 22.334 |
| 7.732454493305555 | 22.313 |
| 7.735520502027778 | 22.324 |
| 7.738580677055556 | 22.334 |
| 7.741671409388889 | 22.324 |
| 7.744743807333333 | 22.334 |
| 7.747803982361111 | 22.324 |
| 7.7508636018055554 | 22.334 |
| 7.753927110361111 | 22.324 |
| 7.7569870076111105 | 22.324 |
| 7.760046627055556 | 22.313 |
| 7.763107079888889 | 22.313 |
| 7.766166977111111 | 22.313 |
| 7.769230763472222 | 22.334 |
| 7.772293994222222 | 22.313 |
| 7.775357780583334 | 22.302 |
| 7.7784243448611115 | 22.324 |
| 7.781495353861111 | 22.313 |
| 7.784554973305556 | 22.324 |
| 7.787619593027777 | 22.334 |
| 7.7906789346666665 | 22.324 |
| 7.793741887638889 | 22.324 |
| 7.796806785166667 | 22.302 |
| 7.79986890475 | 22.313 |
| 7.802928801999999 | 22.324 |
| 7.805991754972222 | 22.324 |
| 7.809051652194444 | 22.324 |
| 7.812111549444445 | 22.313 |
| 7.815182002833333 | 22.313 |
| 7.818244678027778 | 22.345 |
| 7.821304575249999 | 22.334 |
| 7.8243914184722225 | 22.334 |
| 7.8274543714444444 | 22.324 |
| 7.830515657638889 | 22.324 |
| 7.833579444000001 | 22.324 |
| 7.836639063444444 | 22.334 |
| 7.839702849805556 | 22.324 |
| 7.842765524972222 | 22.324 |
| 7.845826255583334 | 22.345 |
| 7.848893931055556 | 22.356 |
| 7.851955772833334 | 22.356 |
| 7.855015392277777 | 22.366 |
| 7.858076956277778 | 22.345 |
| 7.861143242777778 | 22.356 |
| 7.864202862222222 | 22.356 |
| 7.867262481666667 | 22.356 |
| 7.870324323472222 | 22.356 |
| 7.873383942916667 | 22.356 |
| 7.876443284555556 | 22.377 |
| 7.879503459583334 | 22.366 |
| 7.882564468000001 | 22.366 |
| 7.88562436525 | 22.377 |
| 7.88868592925 | 22.356 |
| 7.891748326638889 | 22.366 |
| 7.894808501666667 | 22.356 |
| 7.897868121111111 | 22.377 |
| 7.90092746275 | 22.377 |
| 7.903987637777778 | 22.399 |
| 7.907047812805556 | 22.377 |
| 7.91010743225 | 22.377 |
| 7.913170940805555 | 22.388 |
| 7.916231115861111 | 22.377 |
| 7.919293513222223 | 22.388 |
| 7.922353688277778 | 22.388 |
| 7.925419141388889 | 22.399 |
| 7.92848153875 | 22.377 |
| 7.931540880416667 | 22.377 |
| 7.934602444416667 | 22.399 |
| 7.937664008416666 | 22.399 |
| 7.940724183444445 | 22.42 |
| 7.9437843584722225 | 22.377 |
| 7.9468445335 | 22.388 |
| 7.949905819722223 | 22.388 |
| 7.952965161361111 | 22.399 |
| 7.9560264475833335 | 22.399 |
| 7.959089956138889 | 22.366 |
| 7.962149297777778 | 22.399 |
| 7.9652164176388895 | 22.399 |
| 7.968277703861111 | 22.377 |
| 7.971338712277778 | 22.388 |
| 7.974427500055556 | 22.388 |
| 7.9774893418333335 | 22.399 |
| 7.980554239361112 | 22.399 |
| 7.983617470138889 | 22.399 |
| 7.986677367361111 | 22.388 |
| 7.989746431805556 | 22.388 |
| 7.992807162416667 | 22.399 |
| 7.995886505222223 | 22.366 |
| 7.998949180388888 | 22.409 |
| 8.002008799833334 | 22.409 |